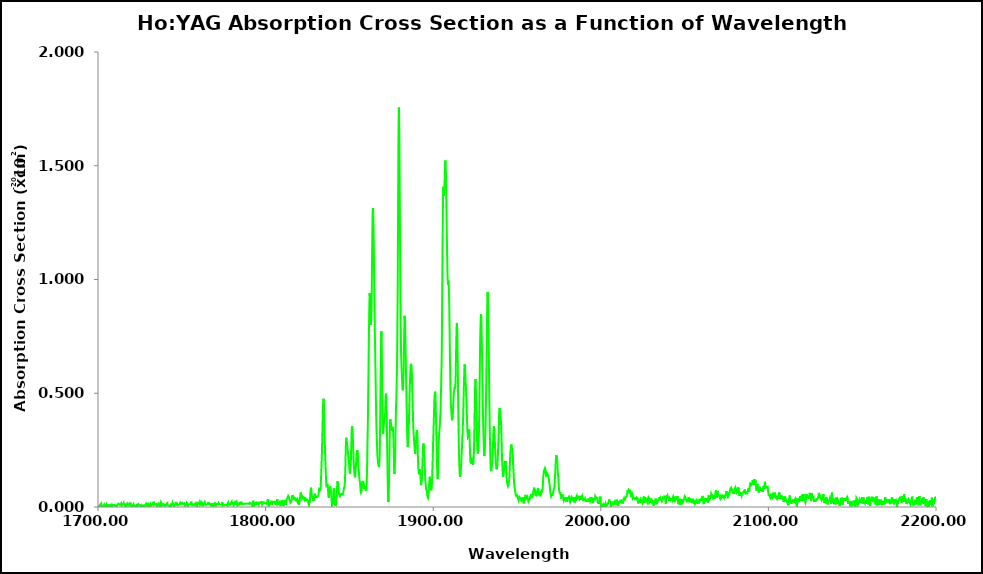
| Category | Series 0 |
|---|---|
| 1700.0 | 0.007 |
| 1700.1 | 0.005 |
| 1700.2 | 0.004 |
| 1700.3 | 0.005 |
| 1700.4 | 0.001 |
| 1700.5 | 0.006 |
| 1700.6 | 0.007 |
| 1700.7 | 0.004 |
| 1700.8 | 0.001 |
| 1700.9 | 0.002 |
| 1701.0 | 0.005 |
| 1701.1 | 0.004 |
| 1701.2 | 0.005 |
| 1701.3 | 0.01 |
| 1701.4 | 0.012 |
| 1701.5 | 0.01 |
| 1701.6 | 0.008 |
| 1701.7 | 0.011 |
| 1701.8 | 0.014 |
| 1701.9 | 0.015 |
| 1702.0 | 0.01 |
| 1702.1 | 0.012 |
| 1702.2 | 0.007 |
| 1702.3 | 0.004 |
| 1702.4 | 0.003 |
| 1702.5 | 0.005 |
| 1702.6 | 0.005 |
| 1702.7 | 0.006 |
| 1702.8 | 0.004 |
| 1702.9 | 0.002 |
| 1703.0 | 0.003 |
| 1703.1 | 0.004 |
| 1703.2 | 0.006 |
| 1703.3 | 0.007 |
| 1703.4 | 0.003 |
| 1703.5 | 0.001 |
| 1703.6 | 0.003 |
| 1703.7 | 0 |
| 1703.8 | 0.003 |
| 1703.9 | 0.01 |
| 1704.0 | 0.008 |
| 1704.1 | 0.008 |
| 1704.2 | 0.006 |
| 1704.3 | 0.008 |
| 1704.4 | 0.002 |
| 1704.5 | 0.003 |
| 1704.6 | 0.01 |
| 1704.7 | 0.008 |
| 1704.8 | 0.008 |
| 1704.9 | 0.006 |
| 1705.0 | 0.002 |
| 1705.1 | 0.003 |
| 1705.2 | 0.01 |
| 1705.3 | 0.008 |
| 1705.4 | 0.008 |
| 1705.5 | 0.006 |
| 1705.6 | 0.004 |
| 1705.7 | 0.006 |
| 1705.8 | 0.009 |
| 1705.9 | 0.009 |
| 1706.0 | 0.01 |
| 1706.1 | 0.009 |
| 1706.2 | 0.01 |
| 1706.3 | 0.009 |
| 1706.4 | 0.008 |
| 1706.5 | 0.01 |
| 1706.6 | 0.007 |
| 1706.7 | 0.004 |
| 1706.8 | 0.003 |
| 1706.9 | 0.008 |
| 1707.0 | 0.003 |
| 1707.1 | 0.007 |
| 1707.2 | 0.008 |
| 1707.3 | 0.008 |
| 1707.4 | 0.009 |
| 1707.5 | 0.01 |
| 1707.6 | 0.006 |
| 1707.7 | 0.005 |
| 1707.8 | 0.001 |
| 1707.9 | 0.001 |
| 1708.0 | 0.001 |
| 1708.1 | 0.001 |
| 1708.2 | 0.008 |
| 1708.3 | 0.006 |
| 1708.4 | 0.001 |
| 1708.5 | 0.008 |
| 1708.6 | 0.006 |
| 1708.7 | 0.004 |
| 1708.8 | 0.006 |
| 1708.9 | 0.007 |
| 1709.0 | 0.005 |
| 1709.1 | 0.007 |
| 1709.2 | 0.013 |
| 1709.3 | 0.008 |
| 1709.4 | 0.01 |
| 1709.5 | 0.008 |
| 1709.6 | 0.006 |
| 1709.7 | 0.006 |
| 1709.8 | 0.01 |
| 1709.9 | 0.008 |
| 1710.0 | 0.006 |
| 1710.1 | 0.008 |
| 1710.2 | 0.008 |
| 1710.3 | 0.005 |
| 1710.4 | 0.006 |
| 1710.5 | 0.007 |
| 1710.6 | 0.007 |
| 1710.7 | 0.007 |
| 1710.8 | 0.005 |
| 1710.9 | 0.005 |
| 1711.0 | 0.006 |
| 1711.1 | 0.002 |
| 1711.2 | 0.006 |
| 1711.3 | 0.001 |
| 1711.4 | 0.006 |
| 1711.5 | 0.008 |
| 1711.6 | 0.01 |
| 1711.7 | 0.011 |
| 1711.8 | 0.014 |
| 1711.9 | 0.012 |
| 1712.0 | 0.013 |
| 1712.1 | 0.013 |
| 1712.2 | 0.013 |
| 1712.3 | 0.015 |
| 1712.4 | 0.014 |
| 1712.5 | 0.011 |
| 1712.6 | 0.013 |
| 1712.7 | 0.011 |
| 1712.8 | 0.009 |
| 1712.9 | 0.009 |
| 1713.0 | 0.01 |
| 1713.1 | 0.01 |
| 1713.2 | 0.012 |
| 1713.3 | 0.008 |
| 1713.4 | 0.011 |
| 1713.5 | 0.01 |
| 1713.6 | 0.013 |
| 1713.7 | 0.013 |
| 1713.8 | 0.016 |
| 1713.9 | 0.011 |
| 1714.0 | 0.009 |
| 1714.1 | 0.005 |
| 1714.2 | 0.006 |
| 1714.3 | 0.007 |
| 1714.4 | 0.012 |
| 1714.5 | 0.012 |
| 1714.6 | 0.011 |
| 1714.7 | 0.012 |
| 1714.8 | 0.007 |
| 1714.9 | 0.008 |
| 1715.0 | 0.013 |
| 1715.1 | 0.017 |
| 1715.2 | 0.015 |
| 1715.3 | 0.018 |
| 1715.4 | 0.015 |
| 1715.5 | 0.013 |
| 1715.6 | 0.009 |
| 1715.7 | 0.008 |
| 1715.8 | 0.008 |
| 1715.9 | 0.008 |
| 1716.0 | 0.007 |
| 1716.1 | 0.003 |
| 1716.2 | 0.005 |
| 1716.3 | 0.004 |
| 1716.4 | 0.005 |
| 1716.5 | 0.007 |
| 1716.6 | 0.01 |
| 1716.7 | 0.006 |
| 1716.8 | 0.003 |
| 1716.9 | 0.001 |
| 1717.0 | 0.001 |
| 1717.1 | 0.002 |
| 1717.2 | 0.004 |
| 1717.3 | 0.008 |
| 1717.4 | 0.009 |
| 1717.5 | 0.007 |
| 1717.6 | 0.011 |
| 1717.7 | 0.015 |
| 1717.8 | 0.014 |
| 1717.9 | 0.014 |
| 1718.0 | 0.013 |
| 1718.1 | 0.013 |
| 1718.2 | 0.009 |
| 1718.3 | 0.009 |
| 1718.4 | 0.01 |
| 1718.5 | 0.01 |
| 1718.6 | 0.006 |
| 1718.7 | 0.014 |
| 1718.8 | 0.009 |
| 1718.9 | 0.011 |
| 1719.0 | 0.012 |
| 1719.1 | 0.011 |
| 1719.2 | 0.008 |
| 1719.3 | 0.013 |
| 1719.4 | 0.009 |
| 1719.5 | 0.009 |
| 1719.6 | 0.009 |
| 1719.7 | 0.006 |
| 1719.8 | 0.004 |
| 1719.9 | 0.001 |
| 1720.0 | 0.009 |
| 1720.1 | 0.009 |
| 1720.2 | 0.006 |
| 1720.3 | 0.004 |
| 1720.4 | 0.005 |
| 1720.5 | 0.009 |
| 1720.6 | 0.012 |
| 1720.7 | 0.009 |
| 1720.8 | 0 |
| 1720.9 | 0.006 |
| 1721.0 | 0.005 |
| 1721.1 | 0.009 |
| 1721.2 | 0.012 |
| 1721.3 | 0.009 |
| 1721.4 | 0.007 |
| 1721.5 | 0.01 |
| 1721.6 | 0.01 |
| 1721.7 | 0.004 |
| 1721.8 | 0.006 |
| 1721.9 | 0.008 |
| 1722.0 | 0.007 |
| 1722.1 | 0.006 |
| 1722.2 | 0.007 |
| 1722.3 | 0.007 |
| 1722.4 | 0.006 |
| 1722.5 | 0.006 |
| 1722.6 | 0.002 |
| 1722.7 | 0.002 |
| 1722.8 | 0.001 |
| 1722.9 | 0.004 |
| 1723.0 | 0.001 |
| 1723.1 | 0.004 |
| 1723.2 | 0.007 |
| 1723.3 | 0.01 |
| 1723.4 | 0.014 |
| 1723.5 | 0.011 |
| 1723.6 | 0.007 |
| 1723.7 | 0.009 |
| 1723.8 | 0.005 |
| 1723.9 | 0.004 |
| 1724.0 | 0.008 |
| 1724.1 | 0.012 |
| 1724.2 | 0.009 |
| 1724.3 | 0.009 |
| 1724.4 | 0.007 |
| 1724.5 | 0.003 |
| 1724.6 | 0.004 |
| 1724.7 | 0.005 |
| 1724.8 | 0.008 |
| 1724.9 | 0.01 |
| 1725.0 | 0.008 |
| 1725.1 | 0.009 |
| 1725.2 | 0.007 |
| 1725.3 | 0.005 |
| 1725.4 | 0.002 |
| 1725.5 | 0.003 |
| 1725.6 | 0.005 |
| 1725.7 | 0.006 |
| 1725.8 | 0.004 |
| 1725.9 | 0.005 |
| 1726.0 | 0.008 |
| 1726.1 | 0.007 |
| 1726.2 | 0.007 |
| 1726.3 | 0.007 |
| 1726.4 | 0.007 |
| 1726.5 | 0.006 |
| 1726.6 | 0.002 |
| 1726.7 | 0 |
| 1726.8 | 0.005 |
| 1726.9 | 0.006 |
| 1727.0 | 0.002 |
| 1727.1 | 0.003 |
| 1727.2 | 0.006 |
| 1727.3 | 0.003 |
| 1727.4 | 0.002 |
| 1727.5 | 0.006 |
| 1727.6 | 0.007 |
| 1727.7 | 0.008 |
| 1727.8 | 0.008 |
| 1727.9 | 0.01 |
| 1728.0 | 0.005 |
| 1728.1 | 0.006 |
| 1728.2 | 0.008 |
| 1728.3 | 0.008 |
| 1728.4 | 0.01 |
| 1728.5 | 0.002 |
| 1728.6 | 0.005 |
| 1728.7 | 0.014 |
| 1728.8 | 0.019 |
| 1728.9 | 0.016 |
| 1729.0 | 0.015 |
| 1729.1 | 0.009 |
| 1729.2 | 0.006 |
| 1729.3 | 0.015 |
| 1729.4 | 0.002 |
| 1729.5 | 0.001 |
| 1729.6 | 0.003 |
| 1729.7 | 0.001 |
| 1729.8 | 0.005 |
| 1729.9 | 0.007 |
| 1730.0 | 0.008 |
| 1730.1 | 0.008 |
| 1730.2 | 0.011 |
| 1730.3 | 0.01 |
| 1730.4 | 0.011 |
| 1730.5 | 0.008 |
| 1730.6 | 0.007 |
| 1730.7 | 0.004 |
| 1730.8 | 0.012 |
| 1730.9 | 0.01 |
| 1731.0 | 0.012 |
| 1731.1 | 0.013 |
| 1731.2 | 0.014 |
| 1731.3 | 0.009 |
| 1731.4 | 0.008 |
| 1731.5 | 0.013 |
| 1731.6 | 0.011 |
| 1731.7 | 0.009 |
| 1731.8 | 0.009 |
| 1731.9 | 0.008 |
| 1732.0 | 0.006 |
| 1732.1 | 0.01 |
| 1732.2 | 0.011 |
| 1732.3 | 0.007 |
| 1732.4 | 0.008 |
| 1732.5 | 0.01 |
| 1732.6 | 0.009 |
| 1732.7 | 0.012 |
| 1732.8 | 0.016 |
| 1732.9 | 0.017 |
| 1733.0 | 0.012 |
| 1733.1 | 0.011 |
| 1733.2 | 0.01 |
| 1733.3 | 0.012 |
| 1733.4 | 0.015 |
| 1733.5 | 0.017 |
| 1733.6 | 0.016 |
| 1733.7 | 0.016 |
| 1733.8 | 0.011 |
| 1733.9 | 0.009 |
| 1734.0 | 0.009 |
| 1734.1 | 0.007 |
| 1734.2 | 0.007 |
| 1734.3 | 0.012 |
| 1734.4 | 0.013 |
| 1734.5 | 0.01 |
| 1734.6 | 0.012 |
| 1734.7 | 0.014 |
| 1734.8 | 0.011 |
| 1734.9 | 0.008 |
| 1735.0 | 0.008 |
| 1735.1 | 0.009 |
| 1735.2 | 0.004 |
| 1735.3 | 0.006 |
| 1735.4 | 0.008 |
| 1735.5 | 0.014 |
| 1735.6 | 0.014 |
| 1735.7 | 0.016 |
| 1735.8 | 0.014 |
| 1735.9 | 0.016 |
| 1736.0 | 0.017 |
| 1736.1 | 0.016 |
| 1736.2 | 0.018 |
| 1736.3 | 0.019 |
| 1736.4 | 0.014 |
| 1736.5 | 0.007 |
| 1736.6 | 0.005 |
| 1736.7 | 0.004 |
| 1736.8 | 0.004 |
| 1736.9 | 0.002 |
| 1737.0 | 0.004 |
| 1737.1 | 0.006 |
| 1737.2 | 0.008 |
| 1737.3 | 0.008 |
| 1737.4 | 0.014 |
| 1737.5 | 0.018 |
| 1737.6 | 0.021 |
| 1737.7 | 0.018 |
| 1737.8 | 0.017 |
| 1737.9 | 0.016 |
| 1738.0 | 0.012 |
| 1738.1 | 0.007 |
| 1738.2 | 0.007 |
| 1738.3 | 0.007 |
| 1738.4 | 0.006 |
| 1738.5 | 0.011 |
| 1738.6 | 0.012 |
| 1738.7 | 0.015 |
| 1738.8 | 0.014 |
| 1738.9 | 0.015 |
| 1739.0 | 0.015 |
| 1739.1 | 0.015 |
| 1739.2 | 0.013 |
| 1739.3 | 0.014 |
| 1739.4 | 0.017 |
| 1739.5 | 0.009 |
| 1739.6 | 0.007 |
| 1739.7 | 0.002 |
| 1739.8 | 0.005 |
| 1739.9 | 0.003 |
| 1740.0 | 0.008 |
| 1740.1 | 0.007 |
| 1740.2 | 0.007 |
| 1740.3 | 0.006 |
| 1740.4 | 0.006 |
| 1740.5 | 0.005 |
| 1740.6 | 0.008 |
| 1740.7 | 0.012 |
| 1740.8 | 0.014 |
| 1740.9 | 0.01 |
| 1741.0 | 0.012 |
| 1741.1 | 0.014 |
| 1741.2 | 0.016 |
| 1741.3 | 0.016 |
| 1741.4 | 0.018 |
| 1741.5 | 0.011 |
| 1741.6 | 0.01 |
| 1741.7 | 0.01 |
| 1741.8 | 0.006 |
| 1741.9 | 0.002 |
| 1742.0 | 0.005 |
| 1742.1 | 0.004 |
| 1742.2 | 0.002 |
| 1742.3 | 0.003 |
| 1742.4 | 0.006 |
| 1742.5 | 0.007 |
| 1742.6 | 0.009 |
| 1742.7 | 0.007 |
| 1742.8 | 0.003 |
| 1742.9 | 0.006 |
| 1743.0 | 0.002 |
| 1743.1 | 0.007 |
| 1743.2 | 0.009 |
| 1743.3 | 0.007 |
| 1743.4 | 0.004 |
| 1743.5 | 0.011 |
| 1743.6 | 0.006 |
| 1743.7 | 0.01 |
| 1743.8 | 0.016 |
| 1743.9 | 0.016 |
| 1744.0 | 0.008 |
| 1744.1 | 0.007 |
| 1744.2 | 0.009 |
| 1744.3 | 0.008 |
| 1744.4 | 0.013 |
| 1744.5 | 0.018 |
| 1744.6 | 0.018 |
| 1744.7 | 0.015 |
| 1744.8 | 0.018 |
| 1744.9 | 0.012 |
| 1745.0 | 0.012 |
| 1745.1 | 0.008 |
| 1745.2 | 0.006 |
| 1745.3 | 0.002 |
| 1745.4 | 0.004 |
| 1745.5 | 0.002 |
| 1745.6 | 0.003 |
| 1745.7 | 0.002 |
| 1745.8 | 0.007 |
| 1745.9 | 0.008 |
| 1746.0 | 0.008 |
| 1746.1 | 0.011 |
| 1746.2 | 0.016 |
| 1746.3 | 0.012 |
| 1746.4 | 0.014 |
| 1746.5 | 0.014 |
| 1746.6 | 0.014 |
| 1746.7 | 0.012 |
| 1746.8 | 0.011 |
| 1746.9 | 0.015 |
| 1747.0 | 0.013 |
| 1747.1 | 0.016 |
| 1747.2 | 0.019 |
| 1747.3 | 0.02 |
| 1747.4 | 0.017 |
| 1747.5 | 0.015 |
| 1747.6 | 0.015 |
| 1747.7 | 0.008 |
| 1747.8 | 0.007 |
| 1747.9 | 0.008 |
| 1748.0 | 0.005 |
| 1748.1 | 0.003 |
| 1748.2 | 0.008 |
| 1748.3 | 0.01 |
| 1748.4 | 0.008 |
| 1748.5 | 0.013 |
| 1748.6 | 0.013 |
| 1748.7 | 0.01 |
| 1748.8 | 0.012 |
| 1748.9 | 0.012 |
| 1749.0 | 0.014 |
| 1749.1 | 0.019 |
| 1749.2 | 0.023 |
| 1749.3 | 0.02 |
| 1749.4 | 0.02 |
| 1749.5 | 0.019 |
| 1749.6 | 0.016 |
| 1749.7 | 0.014 |
| 1749.8 | 0.011 |
| 1749.9 | 0.015 |
| 1750.0 | 0.015 |
| 1750.1 | 0.015 |
| 1750.2 | 0.015 |
| 1750.3 | 0.019 |
| 1750.4 | 0.016 |
| 1750.5 | 0.018 |
| 1750.6 | 0.02 |
| 1750.7 | 0.018 |
| 1750.8 | 0.015 |
| 1750.9 | 0.013 |
| 1751.0 | 0.01 |
| 1751.1 | 0.011 |
| 1751.2 | 0.013 |
| 1751.3 | 0.015 |
| 1751.4 | 0.017 |
| 1751.5 | 0.016 |
| 1751.6 | 0.014 |
| 1751.7 | 0.013 |
| 1751.8 | 0.01 |
| 1751.9 | 0.008 |
| 1752.0 | 0.006 |
| 1752.1 | 0.004 |
| 1752.2 | 0.002 |
| 1752.3 | 0.004 |
| 1752.4 | 0.004 |
| 1752.5 | 0.007 |
| 1752.6 | 0.009 |
| 1752.7 | 0.011 |
| 1752.8 | 0.01 |
| 1752.9 | 0.014 |
| 1753.0 | 0.018 |
| 1753.1 | 0.018 |
| 1753.2 | 0.019 |
| 1753.3 | 0.02 |
| 1753.4 | 0.02 |
| 1753.5 | 0.012 |
| 1753.6 | 0.01 |
| 1753.7 | 0.005 |
| 1753.8 | 0.006 |
| 1753.9 | 0.005 |
| 1754.0 | 0.009 |
| 1754.1 | 0.007 |
| 1754.2 | 0.011 |
| 1754.3 | 0.008 |
| 1754.4 | 0.008 |
| 1754.5 | 0.008 |
| 1754.6 | 0.011 |
| 1754.7 | 0.012 |
| 1754.8 | 0.012 |
| 1754.9 | 0.013 |
| 1755.0 | 0.009 |
| 1755.1 | 0.009 |
| 1755.2 | 0.01 |
| 1755.3 | 0.01 |
| 1755.4 | 0.01 |
| 1755.5 | 0.016 |
| 1755.6 | 0.023 |
| 1755.7 | 0.02 |
| 1755.8 | 0.017 |
| 1755.9 | 0.015 |
| 1756.0 | 0.015 |
| 1756.1 | 0.007 |
| 1756.2 | 0.01 |
| 1756.3 | 0.015 |
| 1756.4 | 0.012 |
| 1756.5 | 0.012 |
| 1756.6 | 0.008 |
| 1756.7 | 0.004 |
| 1756.8 | 0.005 |
| 1756.9 | 0.008 |
| 1757.0 | 0.009 |
| 1757.1 | 0.007 |
| 1757.2 | 0.008 |
| 1757.3 | 0.009 |
| 1757.4 | 0.008 |
| 1757.5 | 0.005 |
| 1757.6 | 0.01 |
| 1757.7 | 0.013 |
| 1757.8 | 0.013 |
| 1757.9 | 0.015 |
| 1758.0 | 0.014 |
| 1758.1 | 0.016 |
| 1758.2 | 0.015 |
| 1758.3 | 0.018 |
| 1758.4 | 0.017 |
| 1758.5 | 0.018 |
| 1758.6 | 0.013 |
| 1758.7 | 0.007 |
| 1758.8 | 0.002 |
| 1758.9 | 0.007 |
| 1759.0 | 0.002 |
| 1759.1 | 0.008 |
| 1759.2 | 0.012 |
| 1759.3 | 0.017 |
| 1759.4 | 0.023 |
| 1759.5 | 0.021 |
| 1759.6 | 0.017 |
| 1759.7 | 0.019 |
| 1759.8 | 0.016 |
| 1759.9 | 0.015 |
| 1760.0 | 0.017 |
| 1760.1 | 0.021 |
| 1760.2 | 0.019 |
| 1760.3 | 0.015 |
| 1760.4 | 0.013 |
| 1760.5 | 0.013 |
| 1760.6 | 0.011 |
| 1760.7 | 0.014 |
| 1760.8 | 0.023 |
| 1760.9 | 0.02 |
| 1761.0 | 0.019 |
| 1761.1 | 0.018 |
| 1761.2 | 0.015 |
| 1761.3 | 0.009 |
| 1761.4 | 0.013 |
| 1761.5 | 0.009 |
| 1761.6 | 0.007 |
| 1761.7 | 0.008 |
| 1761.8 | 0.007 |
| 1761.9 | 0.01 |
| 1762.0 | 0.016 |
| 1762.1 | 0.019 |
| 1762.2 | 0.016 |
| 1762.3 | 0.018 |
| 1762.4 | 0.016 |
| 1762.5 | 0.009 |
| 1762.6 | 0.008 |
| 1762.7 | 0.015 |
| 1762.8 | 0.015 |
| 1762.9 | 0.016 |
| 1763.0 | 0.01 |
| 1763.1 | 0.009 |
| 1763.2 | 0.008 |
| 1763.3 | 0.009 |
| 1763.4 | 0.008 |
| 1763.5 | 0.012 |
| 1763.6 | 0.017 |
| 1763.7 | 0.012 |
| 1763.8 | 0.018 |
| 1763.9 | 0.019 |
| 1764.0 | 0.022 |
| 1764.1 | 0.014 |
| 1764.2 | 0.017 |
| 1764.3 | 0.01 |
| 1764.4 | 0.007 |
| 1764.5 | 0.008 |
| 1764.6 | 0.011 |
| 1764.7 | 0.012 |
| 1764.8 | 0.012 |
| 1764.9 | 0.012 |
| 1765.0 | 0.012 |
| 1765.1 | 0.012 |
| 1765.2 | 0.011 |
| 1765.3 | 0.011 |
| 1765.4 | 0.012 |
| 1765.5 | 0.012 |
| 1765.6 | 0.018 |
| 1765.7 | 0.018 |
| 1765.8 | 0.019 |
| 1765.9 | 0.022 |
| 1766.0 | 0.022 |
| 1766.1 | 0.022 |
| 1766.2 | 0.018 |
| 1766.3 | 0.019 |
| 1766.4 | 0.02 |
| 1766.5 | 0.019 |
| 1766.6 | 0.013 |
| 1766.7 | 0.013 |
| 1766.8 | 0.018 |
| 1766.9 | 0.016 |
| 1767.0 | 0.012 |
| 1767.1 | 0.009 |
| 1767.2 | 0.014 |
| 1767.3 | 0.011 |
| 1767.4 | 0.008 |
| 1767.5 | 0.014 |
| 1767.6 | 0.012 |
| 1767.7 | 0.01 |
| 1767.8 | 0.008 |
| 1767.9 | 0.008 |
| 1768.0 | 0.004 |
| 1768.1 | 0.017 |
| 1768.2 | 0.014 |
| 1768.3 | 0.012 |
| 1768.4 | 0.014 |
| 1768.5 | 0.013 |
| 1768.6 | 0.003 |
| 1768.7 | 0.007 |
| 1768.8 | 0.006 |
| 1768.9 | 0.005 |
| 1769.0 | 0.007 |
| 1769.1 | 0.009 |
| 1769.2 | 0.008 |
| 1769.3 | 0.012 |
| 1769.4 | 0.015 |
| 1769.5 | 0.017 |
| 1769.6 | 0.02 |
| 1769.7 | 0.016 |
| 1769.8 | 0.013 |
| 1769.9 | 0.012 |
| 1770.0 | 0.008 |
| 1770.1 | 0.011 |
| 1770.2 | 0.013 |
| 1770.3 | 0.013 |
| 1770.4 | 0.01 |
| 1770.5 | 0.015 |
| 1770.6 | 0.008 |
| 1770.7 | 0.01 |
| 1770.8 | 0.008 |
| 1770.9 | 0.011 |
| 1771.0 | 0.01 |
| 1771.1 | 0.011 |
| 1771.2 | 0.013 |
| 1771.3 | 0.015 |
| 1771.4 | 0.017 |
| 1771.5 | 0.011 |
| 1771.6 | 0.01 |
| 1771.7 | 0.01 |
| 1771.8 | 0.011 |
| 1771.9 | 0.008 |
| 1772.0 | 0.017 |
| 1772.1 | 0.021 |
| 1772.2 | 0.019 |
| 1772.3 | 0.014 |
| 1772.4 | 0.018 |
| 1772.5 | 0.011 |
| 1772.6 | 0.011 |
| 1772.7 | 0.015 |
| 1772.8 | 0.014 |
| 1772.9 | 0.01 |
| 1773.0 | 0.012 |
| 1773.1 | 0.01 |
| 1773.2 | 0.008 |
| 1773.3 | 0.01 |
| 1773.4 | 0.011 |
| 1773.5 | 0.007 |
| 1773.6 | 0.009 |
| 1773.7 | 0.012 |
| 1773.8 | 0.011 |
| 1773.9 | 0.013 |
| 1774.0 | 0.02 |
| 1774.1 | 0.013 |
| 1774.2 | 0.01 |
| 1774.3 | 0.008 |
| 1774.4 | 0.01 |
| 1774.5 | 0.008 |
| 1774.6 | 0.013 |
| 1774.7 | 0.016 |
| 1774.8 | 0.013 |
| 1774.9 | 0.008 |
| 1775.0 | 0.007 |
| 1775.1 | 0.007 |
| 1775.2 | 0.006 |
| 1775.3 | 0.009 |
| 1775.4 | 0.009 |
| 1775.5 | 0.008 |
| 1775.6 | 0.011 |
| 1775.7 | 0.008 |
| 1775.8 | 0.008 |
| 1775.9 | 0.01 |
| 1776.0 | 0.012 |
| 1776.1 | 0.01 |
| 1776.2 | 0.011 |
| 1776.3 | 0.011 |
| 1776.4 | 0.01 |
| 1776.5 | 0.009 |
| 1776.6 | 0.008 |
| 1776.7 | 0.01 |
| 1776.8 | 0.015 |
| 1776.9 | 0.008 |
| 1777.0 | 0.008 |
| 1777.1 | 0.009 |
| 1777.2 | 0.007 |
| 1777.3 | 0.006 |
| 1777.4 | 0.015 |
| 1777.5 | 0.018 |
| 1777.6 | 0.019 |
| 1777.7 | 0.02 |
| 1777.8 | 0.018 |
| 1777.9 | 0.014 |
| 1778.0 | 0.01 |
| 1778.1 | 0.014 |
| 1778.2 | 0.011 |
| 1778.3 | 0.013 |
| 1778.4 | 0.016 |
| 1778.5 | 0.012 |
| 1778.6 | 0.006 |
| 1778.7 | 0.005 |
| 1778.8 | 0.008 |
| 1778.9 | 0.012 |
| 1779.0 | 0.012 |
| 1779.1 | 0.012 |
| 1779.2 | 0.016 |
| 1779.3 | 0.018 |
| 1779.4 | 0.014 |
| 1779.5 | 0.017 |
| 1779.6 | 0.02 |
| 1779.7 | 0.023 |
| 1779.8 | 0.015 |
| 1779.9 | 0.014 |
| 1780.0 | 0.016 |
| 1780.1 | 0.017 |
| 1780.2 | 0.014 |
| 1780.3 | 0.018 |
| 1780.4 | 0.017 |
| 1780.5 | 0.017 |
| 1780.6 | 0.011 |
| 1780.7 | 0.011 |
| 1780.8 | 0.009 |
| 1780.9 | 0.007 |
| 1781.0 | 0.006 |
| 1781.1 | 0.012 |
| 1781.2 | 0.015 |
| 1781.3 | 0.012 |
| 1781.4 | 0.015 |
| 1781.5 | 0.017 |
| 1781.6 | 0.015 |
| 1781.7 | 0.01 |
| 1781.8 | 0.016 |
| 1781.9 | 0.015 |
| 1782.0 | 0.014 |
| 1782.1 | 0.015 |
| 1782.2 | 0.021 |
| 1782.3 | 0.021 |
| 1782.4 | 0.021 |
| 1782.5 | 0.019 |
| 1782.6 | 0.018 |
| 1782.7 | 0.014 |
| 1782.8 | 0.017 |
| 1782.9 | 0.02 |
| 1783.0 | 0.022 |
| 1783.1 | 0.018 |
| 1783.2 | 0.014 |
| 1783.3 | 0.01 |
| 1783.4 | 0.009 |
| 1783.5 | 0.01 |
| 1783.6 | 0.011 |
| 1783.7 | 0.013 |
| 1783.8 | 0.01 |
| 1783.9 | 0.01 |
| 1784.0 | 0.012 |
| 1784.1 | 0.012 |
| 1784.2 | 0.012 |
| 1784.3 | 0.017 |
| 1784.4 | 0.015 |
| 1784.5 | 0.011 |
| 1784.6 | 0.01 |
| 1784.7 | 0.011 |
| 1784.8 | 0.009 |
| 1784.9 | 0.009 |
| 1785.0 | 0.009 |
| 1785.1 | 0.014 |
| 1785.2 | 0.02 |
| 1785.3 | 0.022 |
| 1785.4 | 0.02 |
| 1785.5 | 0.023 |
| 1785.6 | 0.023 |
| 1785.7 | 0.018 |
| 1785.8 | 0.02 |
| 1785.9 | 0.023 |
| 1786.0 | 0.018 |
| 1786.1 | 0.015 |
| 1786.2 | 0.012 |
| 1786.3 | 0.009 |
| 1786.4 | 0.011 |
| 1786.5 | 0.011 |
| 1786.6 | 0.01 |
| 1786.7 | 0.01 |
| 1786.8 | 0.013 |
| 1786.9 | 0.013 |
| 1787.0 | 0.017 |
| 1787.1 | 0.016 |
| 1787.2 | 0.017 |
| 1787.3 | 0.015 |
| 1787.4 | 0.015 |
| 1787.5 | 0.012 |
| 1787.6 | 0.015 |
| 1787.7 | 0.016 |
| 1787.8 | 0.017 |
| 1787.9 | 0.016 |
| 1788.0 | 0.014 |
| 1788.1 | 0.013 |
| 1788.2 | 0.012 |
| 1788.3 | 0.013 |
| 1788.4 | 0.014 |
| 1788.5 | 0.012 |
| 1788.6 | 0.014 |
| 1788.7 | 0.013 |
| 1788.8 | 0.012 |
| 1788.9 | 0.013 |
| 1789.0 | 0.016 |
| 1789.1 | 0.016 |
| 1789.2 | 0.015 |
| 1789.3 | 0.015 |
| 1789.4 | 0.012 |
| 1789.5 | 0.012 |
| 1789.6 | 0.015 |
| 1789.7 | 0.016 |
| 1789.8 | 0.016 |
| 1789.9 | 0.017 |
| 1790.0 | 0.018 |
| 1790.1 | 0.015 |
| 1790.2 | 0.016 |
| 1790.3 | 0.012 |
| 1790.4 | 0.013 |
| 1790.5 | 0.016 |
| 1790.6 | 0.018 |
| 1790.7 | 0.02 |
| 1790.8 | 0.022 |
| 1790.9 | 0.02 |
| 1791.0 | 0.019 |
| 1791.1 | 0.019 |
| 1791.2 | 0.015 |
| 1791.3 | 0.014 |
| 1791.4 | 0.015 |
| 1791.5 | 0.014 |
| 1791.6 | 0.013 |
| 1791.7 | 0.014 |
| 1791.8 | 0.012 |
| 1791.9 | 0.013 |
| 1792.0 | 0.006 |
| 1792.1 | 0.004 |
| 1792.2 | 0.006 |
| 1792.3 | 0.013 |
| 1792.4 | 0.014 |
| 1792.5 | 0.028 |
| 1792.6 | 0.026 |
| 1792.7 | 0.027 |
| 1792.8 | 0.021 |
| 1792.9 | 0.015 |
| 1793.0 | 0.009 |
| 1793.1 | 0.01 |
| 1793.2 | 0.004 |
| 1793.3 | 0.005 |
| 1793.4 | 0.007 |
| 1793.5 | 0.01 |
| 1793.6 | 0.011 |
| 1793.7 | 0.015 |
| 1793.8 | 0.013 |
| 1793.9 | 0.019 |
| 1794.0 | 0.016 |
| 1794.1 | 0.016 |
| 1794.2 | 0.017 |
| 1794.3 | 0.019 |
| 1794.4 | 0.016 |
| 1794.5 | 0.012 |
| 1794.6 | 0.015 |
| 1794.7 | 0.015 |
| 1794.8 | 0.016 |
| 1794.9 | 0.011 |
| 1795.0 | 0.013 |
| 1795.1 | 0.013 |
| 1795.2 | 0.009 |
| 1795.3 | 0.01 |
| 1795.4 | 0.016 |
| 1795.5 | 0.018 |
| 1795.6 | 0.015 |
| 1795.7 | 0.019 |
| 1795.8 | 0.016 |
| 1795.9 | 0.011 |
| 1796.0 | 0.012 |
| 1796.1 | 0.019 |
| 1796.2 | 0.018 |
| 1796.3 | 0.019 |
| 1796.4 | 0.023 |
| 1796.5 | 0.021 |
| 1796.6 | 0.019 |
| 1796.7 | 0.02 |
| 1796.8 | 0.021 |
| 1796.9 | 0.018 |
| 1797.0 | 0.021 |
| 1797.1 | 0.02 |
| 1797.2 | 0.017 |
| 1797.3 | 0.018 |
| 1797.4 | 0.021 |
| 1797.5 | 0.025 |
| 1797.6 | 0.018 |
| 1797.7 | 0.018 |
| 1797.8 | 0.015 |
| 1797.9 | 0.011 |
| 1798.0 | 0.01 |
| 1798.1 | 0.014 |
| 1798.2 | 0.015 |
| 1798.3 | 0.019 |
| 1798.4 | 0.022 |
| 1798.5 | 0.019 |
| 1798.6 | 0.019 |
| 1798.7 | 0.019 |
| 1798.8 | 0.021 |
| 1798.9 | 0.021 |
| 1799.0 | 0.021 |
| 1799.1 | 0.019 |
| 1799.2 | 0.018 |
| 1799.3 | 0.016 |
| 1799.4 | 0.016 |
| 1799.5 | 0.016 |
| 1799.6 | 0.017 |
| 1799.7 | 0.018 |
| 1799.8 | 0.016 |
| 1799.9 | 0.016 |
| 1800.0 | 0.013 |
| 1800.1 | 0.016 |
| 1800.2 | 0.018 |
| 1800.3 | 0.019 |
| 1800.4 | 0.018 |
| 1800.5 | 0.018 |
| 1800.6 | 0.014 |
| 1800.7 | 0.016 |
| 1800.8 | 0.014 |
| 1800.9 | 0.016 |
| 1801.0 | 0.019 |
| 1801.1 | 0.027 |
| 1801.2 | 0.026 |
| 1801.3 | 0.031 |
| 1801.4 | 0.031 |
| 1801.5 | 0.035 |
| 1801.6 | 0.02 |
| 1801.7 | 0.018 |
| 1801.8 | 0.017 |
| 1801.9 | 0.015 |
| 1802.0 | 0.005 |
| 1802.1 | 0.012 |
| 1802.2 | 0.007 |
| 1802.3 | 0.006 |
| 1802.4 | 0.008 |
| 1802.5 | 0.01 |
| 1802.6 | 0.012 |
| 1802.7 | 0.017 |
| 1802.8 | 0.018 |
| 1802.9 | 0.017 |
| 1803.0 | 0.016 |
| 1803.1 | 0.015 |
| 1803.2 | 0.017 |
| 1803.3 | 0.016 |
| 1803.4 | 0.021 |
| 1803.5 | 0.023 |
| 1803.6 | 0.021 |
| 1803.7 | 0.02 |
| 1803.8 | 0.022 |
| 1803.9 | 0.016 |
| 1804.0 | 0.019 |
| 1804.1 | 0.023 |
| 1804.2 | 0.025 |
| 1804.3 | 0.025 |
| 1804.4 | 0.027 |
| 1804.5 | 0.021 |
| 1804.6 | 0.02 |
| 1804.7 | 0.022 |
| 1804.8 | 0.021 |
| 1804.9 | 0.021 |
| 1805.0 | 0.024 |
| 1805.1 | 0.024 |
| 1805.2 | 0.022 |
| 1805.3 | 0.021 |
| 1805.4 | 0.024 |
| 1805.5 | 0.027 |
| 1805.6 | 0.023 |
| 1805.7 | 0.019 |
| 1805.8 | 0.02 |
| 1805.9 | 0.013 |
| 1806.0 | 0.012 |
| 1806.1 | 0.009 |
| 1806.2 | 0.011 |
| 1806.3 | 0.01 |
| 1806.4 | 0.016 |
| 1806.5 | 0.011 |
| 1806.6 | 0.017 |
| 1806.7 | 0.024 |
| 1806.8 | 0.028 |
| 1806.9 | 0.028 |
| 1807.0 | 0.034 |
| 1807.1 | 0.03 |
| 1807.2 | 0.02 |
| 1807.3 | 0.016 |
| 1807.4 | 0.011 |
| 1807.5 | 0.009 |
| 1807.6 | 0.013 |
| 1807.7 | 0.02 |
| 1807.8 | 0.019 |
| 1807.9 | 0.023 |
| 1808.0 | 0.023 |
| 1808.1 | 0.023 |
| 1808.2 | 0.021 |
| 1808.3 | 0.024 |
| 1808.4 | 0.02 |
| 1808.5 | 0.018 |
| 1808.6 | 0.015 |
| 1808.7 | 0.016 |
| 1808.8 | 0.01 |
| 1808.9 | 0.011 |
| 1809.0 | 0.01 |
| 1809.1 | 0.01 |
| 1809.2 | 0.009 |
| 1809.3 | 0.015 |
| 1809.4 | 0.018 |
| 1809.5 | 0.024 |
| 1809.6 | 0.028 |
| 1809.7 | 0.033 |
| 1809.8 | 0.028 |
| 1809.9 | 0.019 |
| 1810.0 | 0.012 |
| 1810.1 | 0.005 |
| 1810.2 | 0.028 |
| 1810.3 | 0.005 |
| 1810.4 | 0.013 |
| 1810.5 | 0.024 |
| 1810.6 | 0.026 |
| 1810.7 | 0.024 |
| 1810.8 | 0.018 |
| 1810.9 | 0.012 |
| 1811.0 | 0.007 |
| 1811.1 | 0.009 |
| 1811.2 | 0.017 |
| 1811.3 | 0.024 |
| 1811.4 | 0.03 |
| 1811.5 | 0.033 |
| 1811.6 | 0.032 |
| 1811.7 | 0.027 |
| 1811.8 | 0.021 |
| 1811.9 | 0.021 |
| 1812.0 | 0.017 |
| 1812.1 | 0.009 |
| 1812.2 | 0.009 |
| 1812.3 | 0.021 |
| 1812.4 | 0.017 |
| 1812.5 | 0.022 |
| 1812.6 | 0.034 |
| 1812.7 | 0.037 |
| 1812.8 | 0.032 |
| 1812.9 | 0.037 |
| 1813.0 | 0.036 |
| 1813.1 | 0.041 |
| 1813.2 | 0.04 |
| 1813.3 | 0.044 |
| 1813.4 | 0.042 |
| 1813.5 | 0.049 |
| 1813.6 | 0.046 |
| 1813.7 | 0.05 |
| 1813.8 | 0.048 |
| 1813.9 | 0.044 |
| 1814.0 | 0.038 |
| 1814.1 | 0.034 |
| 1814.2 | 0.032 |
| 1814.3 | 0.031 |
| 1814.4 | 0.029 |
| 1814.5 | 0.03 |
| 1814.6 | 0.027 |
| 1814.7 | 0.027 |
| 1814.8 | 0.019 |
| 1814.9 | 0.021 |
| 1815.0 | 0.021 |
| 1815.1 | 0.018 |
| 1815.2 | 0.016 |
| 1815.3 | 0.024 |
| 1815.4 | 0.025 |
| 1815.5 | 0.025 |
| 1815.6 | 0.035 |
| 1815.7 | 0.041 |
| 1815.8 | 0.044 |
| 1815.9 | 0.046 |
| 1816.0 | 0.052 |
| 1816.1 | 0.05 |
| 1816.2 | 0.056 |
| 1816.3 | 0.052 |
| 1816.4 | 0.05 |
| 1816.5 | 0.042 |
| 1816.6 | 0.04 |
| 1816.7 | 0.032 |
| 1816.8 | 0.031 |
| 1816.9 | 0.031 |
| 1817.0 | 0.035 |
| 1817.1 | 0.041 |
| 1817.2 | 0.04 |
| 1817.3 | 0.042 |
| 1817.4 | 0.044 |
| 1817.5 | 0.046 |
| 1817.6 | 0.04 |
| 1817.7 | 0.038 |
| 1817.8 | 0.037 |
| 1817.9 | 0.033 |
| 1818.0 | 0.031 |
| 1818.1 | 0.025 |
| 1818.2 | 0.026 |
| 1818.3 | 0.03 |
| 1818.4 | 0.037 |
| 1818.5 | 0.036 |
| 1818.6 | 0.036 |
| 1818.7 | 0.037 |
| 1818.8 | 0.034 |
| 1818.9 | 0.026 |
| 1819.0 | 0.025 |
| 1819.1 | 0.033 |
| 1819.2 | 0.034 |
| 1819.3 | 0.029 |
| 1819.4 | 0.037 |
| 1819.5 | 0.036 |
| 1819.6 | 0.029 |
| 1819.7 | 0.022 |
| 1819.8 | 0.019 |
| 1819.9 | 0.01 |
| 1820.0 | 0.01 |
| 1820.1 | 0.017 |
| 1820.2 | 0.02 |
| 1820.3 | 0.024 |
| 1820.4 | 0.032 |
| 1820.5 | 0.04 |
| 1820.6 | 0.041 |
| 1820.7 | 0.045 |
| 1820.8 | 0.056 |
| 1820.9 | 0.063 |
| 1821.0 | 0.062 |
| 1821.1 | 0.058 |
| 1821.2 | 0.061 |
| 1821.3 | 0.059 |
| 1821.4 | 0.052 |
| 1821.5 | 0.049 |
| 1821.6 | 0.049 |
| 1821.7 | 0.044 |
| 1821.8 | 0.038 |
| 1821.9 | 0.037 |
| 1822.0 | 0.039 |
| 1822.1 | 0.038 |
| 1822.2 | 0.041 |
| 1822.3 | 0.045 |
| 1822.4 | 0.043 |
| 1822.5 | 0.041 |
| 1822.6 | 0.048 |
| 1822.7 | 0.047 |
| 1822.8 | 0.04 |
| 1822.9 | 0.039 |
| 1823.0 | 0.038 |
| 1823.1 | 0.034 |
| 1823.2 | 0.034 |
| 1823.3 | 0.04 |
| 1823.4 | 0.042 |
| 1823.5 | 0.044 |
| 1823.6 | 0.041 |
| 1823.7 | 0.044 |
| 1823.8 | 0.04 |
| 1823.9 | 0.038 |
| 1824.0 | 0.036 |
| 1824.1 | 0.036 |
| 1824.2 | 0.03 |
| 1824.3 | 0.027 |
| 1824.4 | 0.032 |
| 1824.5 | 0.031 |
| 1824.6 | 0.03 |
| 1824.7 | 0.032 |
| 1824.8 | 0.032 |
| 1824.9 | 0.033 |
| 1825.0 | 0.031 |
| 1825.1 | 0.031 |
| 1825.2 | 0.029 |
| 1825.3 | 0.027 |
| 1825.4 | 0.022 |
| 1825.5 | 0.019 |
| 1825.6 | 0.016 |
| 1825.7 | 0.012 |
| 1825.8 | 0.013 |
| 1825.9 | 0.009 |
| 1826.0 | 0.013 |
| 1826.1 | 0.012 |
| 1826.2 | 0.012 |
| 1826.3 | 0.018 |
| 1826.4 | 0.029 |
| 1826.5 | 0.036 |
| 1826.6 | 0.047 |
| 1826.7 | 0.06 |
| 1826.8 | 0.071 |
| 1826.9 | 0.076 |
| 1827.0 | 0.08 |
| 1827.1 | 0.085 |
| 1827.2 | 0.082 |
| 1827.3 | 0.075 |
| 1827.4 | 0.067 |
| 1827.5 | 0.06 |
| 1827.6 | 0.051 |
| 1827.7 | 0.048 |
| 1827.8 | 0.044 |
| 1827.9 | 0.042 |
| 1828.0 | 0.036 |
| 1828.1 | 0.032 |
| 1828.2 | 0.03 |
| 1828.3 | 0.029 |
| 1828.4 | 0.027 |
| 1828.5 | 0.026 |
| 1828.6 | 0.028 |
| 1828.7 | 0.03 |
| 1828.8 | 0.03 |
| 1828.9 | 0.035 |
| 1829.0 | 0.041 |
| 1829.1 | 0.049 |
| 1829.2 | 0.049 |
| 1829.3 | 0.058 |
| 1829.4 | 0.055 |
| 1829.5 | 0.056 |
| 1829.6 | 0.05 |
| 1829.7 | 0.051 |
| 1829.8 | 0.043 |
| 1829.9 | 0.049 |
| 1830.0 | 0.047 |
| 1830.1 | 0.046 |
| 1830.2 | 0.044 |
| 1830.3 | 0.045 |
| 1830.4 | 0.041 |
| 1830.5 | 0.04 |
| 1830.6 | 0.043 |
| 1830.7 | 0.045 |
| 1830.8 | 0.043 |
| 1830.9 | 0.041 |
| 1831.0 | 0.044 |
| 1831.1 | 0.043 |
| 1831.2 | 0.04 |
| 1831.3 | 0.042 |
| 1831.4 | 0.049 |
| 1831.5 | 0.052 |
| 1831.6 | 0.055 |
| 1831.7 | 0.066 |
| 1831.8 | 0.074 |
| 1831.9 | 0.078 |
| 1832.0 | 0.079 |
| 1832.1 | 0.083 |
| 1832.2 | 0.081 |
| 1832.3 | 0.078 |
| 1832.4 | 0.074 |
| 1832.5 | 0.076 |
| 1832.6 | 0.074 |
| 1832.7 | 0.078 |
| 1832.8 | 0.08 |
| 1832.9 | 0.093 |
| 1833.0 | 0.108 |
| 1833.1 | 0.13 |
| 1833.2 | 0.147 |
| 1833.3 | 0.175 |
| 1833.4 | 0.195 |
| 1833.5 | 0.218 |
| 1833.6 | 0.237 |
| 1833.7 | 0.27 |
| 1833.8 | 0.3 |
| 1833.9 | 0.335 |
| 1834.0 | 0.365 |
| 1834.1 | 0.403 |
| 1834.2 | 0.431 |
| 1834.3 | 0.446 |
| 1834.4 | 0.465 |
| 1834.5 | 0.476 |
| 1834.6 | 0.479 |
| 1834.7 | 0.467 |
| 1834.8 | 0.451 |
| 1834.9 | 0.419 |
| 1835.0 | 0.392 |
| 1835.1 | 0.354 |
| 1835.2 | 0.316 |
| 1835.3 | 0.291 |
| 1835.4 | 0.264 |
| 1835.5 | 0.237 |
| 1835.6 | 0.212 |
| 1835.7 | 0.194 |
| 1835.8 | 0.171 |
| 1835.9 | 0.153 |
| 1836.0 | 0.131 |
| 1836.1 | 0.119 |
| 1836.2 | 0.104 |
| 1836.3 | 0.093 |
| 1836.4 | 0.087 |
| 1836.5 | 0.093 |
| 1836.6 | 0.092 |
| 1836.7 | 0.102 |
| 1836.8 | 0.104 |
| 1836.9 | 0.105 |
| 1837.0 | 0.1 |
| 1837.1 | 0.094 |
| 1837.2 | 0.082 |
| 1837.3 | 0.069 |
| 1837.4 | 0.057 |
| 1837.5 | 0.048 |
| 1837.6 | 0.048 |
| 1837.7 | 0.041 |
| 1837.8 | 0.044 |
| 1837.9 | 0.053 |
| 1838.0 | 0.056 |
| 1838.1 | 0.06 |
| 1838.2 | 0.07 |
| 1838.3 | 0.083 |
| 1838.4 | 0.086 |
| 1838.5 | 0.091 |
| 1838.6 | 0.09 |
| 1838.7 | 0.089 |
| 1838.8 | 0.08 |
| 1838.9 | 0.077 |
| 1839.0 | 0.07 |
| 1839.1 | 0.061 |
| 1839.2 | 0.05 |
| 1839.3 | 0.041 |
| 1839.4 | 0.025 |
| 1839.5 | 0.012 |
| 1839.6 | 0 |
| 1839.7 | 0.041 |
| 1839.8 | 0.025 |
| 1839.9 | 0.012 |
| 1840.0 | 0.009 |
| 1840.1 | 0.016 |
| 1840.2 | 0.026 |
| 1840.3 | 0.039 |
| 1840.4 | 0.053 |
| 1840.5 | 0.068 |
| 1840.6 | 0.081 |
| 1840.7 | 0.08 |
| 1840.8 | 0.079 |
| 1840.9 | 0.074 |
| 1841.0 | 0.061 |
| 1841.1 | 0.052 |
| 1841.2 | 0.046 |
| 1841.3 | 0.036 |
| 1841.4 | 0.025 |
| 1841.5 | 0.017 |
| 1841.6 | 0.008 |
| 1841.7 | 0.022 |
| 1841.8 | 0.004 |
| 1841.9 | 0.009 |
| 1842.0 | 0.014 |
| 1842.1 | 0.022 |
| 1842.2 | 0.032 |
| 1842.3 | 0.035 |
| 1842.4 | 0.045 |
| 1842.5 | 0.062 |
| 1842.6 | 0.078 |
| 1842.7 | 0.095 |
| 1842.8 | 0.109 |
| 1842.9 | 0.113 |
| 1843.0 | 0.111 |
| 1843.1 | 0.116 |
| 1843.2 | 0.111 |
| 1843.3 | 0.104 |
| 1843.4 | 0.098 |
| 1843.5 | 0.09 |
| 1843.6 | 0.072 |
| 1843.7 | 0.064 |
| 1843.8 | 0.057 |
| 1843.9 | 0.057 |
| 1844.0 | 0.056 |
| 1844.1 | 0.056 |
| 1844.2 | 0.053 |
| 1844.3 | 0.053 |
| 1844.4 | 0.047 |
| 1844.5 | 0.048 |
| 1844.6 | 0.05 |
| 1844.7 | 0.052 |
| 1844.8 | 0.053 |
| 1844.9 | 0.057 |
| 1845.0 | 0.057 |
| 1845.1 | 0.055 |
| 1845.2 | 0.055 |
| 1845.3 | 0.058 |
| 1845.4 | 0.059 |
| 1845.5 | 0.057 |
| 1845.6 | 0.057 |
| 1845.7 | 0.056 |
| 1845.8 | 0.057 |
| 1845.9 | 0.058 |
| 1846.0 | 0.053 |
| 1846.1 | 0.055 |
| 1846.2 | 0.059 |
| 1846.3 | 0.059 |
| 1846.4 | 0.059 |
| 1846.5 | 0.068 |
| 1846.6 | 0.077 |
| 1846.7 | 0.078 |
| 1846.8 | 0.083 |
| 1846.9 | 0.087 |
| 1847.0 | 0.087 |
| 1847.1 | 0.09 |
| 1847.2 | 0.1 |
| 1847.3 | 0.11 |
| 1847.4 | 0.127 |
| 1847.5 | 0.15 |
| 1847.6 | 0.177 |
| 1847.7 | 0.214 |
| 1847.8 | 0.245 |
| 1847.9 | 0.27 |
| 1848.0 | 0.296 |
| 1848.1 | 0.304 |
| 1848.2 | 0.301 |
| 1848.3 | 0.298 |
| 1848.4 | 0.293 |
| 1848.5 | 0.285 |
| 1848.6 | 0.276 |
| 1848.7 | 0.266 |
| 1848.8 | 0.261 |
| 1848.9 | 0.254 |
| 1849.0 | 0.248 |
| 1849.1 | 0.242 |
| 1849.2 | 0.235 |
| 1849.3 | 0.224 |
| 1849.4 | 0.218 |
| 1849.5 | 0.209 |
| 1849.6 | 0.199 |
| 1849.7 | 0.193 |
| 1849.8 | 0.186 |
| 1849.9 | 0.179 |
| 1850.0 | 0.167 |
| 1850.1 | 0.161 |
| 1850.2 | 0.152 |
| 1850.3 | 0.149 |
| 1850.4 | 0.147 |
| 1850.5 | 0.152 |
| 1850.6 | 0.158 |
| 1850.7 | 0.176 |
| 1850.8 | 0.188 |
| 1850.9 | 0.21 |
| 1851.0 | 0.237 |
| 1851.1 | 0.27 |
| 1851.2 | 0.294 |
| 1851.3 | 0.322 |
| 1851.4 | 0.34 |
| 1851.5 | 0.347 |
| 1851.6 | 0.356 |
| 1851.7 | 0.355 |
| 1851.8 | 0.346 |
| 1851.9 | 0.329 |
| 1852.0 | 0.318 |
| 1852.1 | 0.292 |
| 1852.2 | 0.267 |
| 1852.3 | 0.247 |
| 1852.4 | 0.231 |
| 1852.5 | 0.21 |
| 1852.6 | 0.193 |
| 1852.7 | 0.183 |
| 1852.8 | 0.169 |
| 1852.9 | 0.158 |
| 1853.0 | 0.147 |
| 1853.1 | 0.14 |
| 1853.2 | 0.138 |
| 1853.3 | 0.136 |
| 1853.4 | 0.131 |
| 1853.5 | 0.139 |
| 1853.6 | 0.151 |
| 1853.7 | 0.153 |
| 1853.8 | 0.167 |
| 1853.9 | 0.183 |
| 1854.0 | 0.195 |
| 1854.1 | 0.21 |
| 1854.2 | 0.22 |
| 1854.3 | 0.226 |
| 1854.4 | 0.235 |
| 1854.5 | 0.236 |
| 1854.6 | 0.235 |
| 1854.7 | 0.25 |
| 1854.8 | 0.253 |
| 1854.9 | 0.244 |
| 1855.0 | 0.236 |
| 1855.1 | 0.219 |
| 1855.2 | 0.199 |
| 1855.3 | 0.187 |
| 1855.4 | 0.177 |
| 1855.5 | 0.167 |
| 1855.6 | 0.165 |
| 1855.7 | 0.152 |
| 1855.8 | 0.139 |
| 1855.9 | 0.13 |
| 1856.0 | 0.126 |
| 1856.1 | 0.116 |
| 1856.2 | 0.115 |
| 1856.3 | 0.111 |
| 1856.4 | 0.102 |
| 1856.5 | 0.089 |
| 1856.6 | 0.084 |
| 1856.7 | 0.07 |
| 1856.8 | 0.066 |
| 1856.9 | 0.064 |
| 1857.0 | 0.064 |
| 1857.1 | 0.063 |
| 1857.2 | 0.067 |
| 1857.3 | 0.073 |
| 1857.4 | 0.085 |
| 1857.5 | 0.094 |
| 1857.6 | 0.104 |
| 1857.7 | 0.11 |
| 1857.8 | 0.111 |
| 1857.9 | 0.108 |
| 1858.0 | 0.111 |
| 1858.1 | 0.109 |
| 1858.2 | 0.111 |
| 1858.3 | 0.111 |
| 1858.4 | 0.11 |
| 1858.5 | 0.102 |
| 1858.6 | 0.093 |
| 1858.7 | 0.085 |
| 1858.8 | 0.082 |
| 1858.9 | 0.079 |
| 1859.0 | 0.084 |
| 1859.1 | 0.09 |
| 1859.2 | 0.093 |
| 1859.3 | 0.094 |
| 1859.4 | 0.094 |
| 1859.5 | 0.089 |
| 1859.6 | 0.083 |
| 1859.7 | 0.078 |
| 1859.8 | 0.076 |
| 1859.9 | 0.07 |
| 1860.0 | 0.067 |
| 1860.1 | 0.072 |
| 1860.2 | 0.084 |
| 1860.3 | 0.093 |
| 1860.4 | 0.123 |
| 1860.5 | 0.159 |
| 1860.6 | 0.191 |
| 1860.7 | 0.233 |
| 1860.8 | 0.284 |
| 1860.9 | 0.325 |
| 1861.0 | 0.366 |
| 1861.1 | 0.425 |
| 1861.2 | 0.485 |
| 1861.3 | 0.54 |
| 1861.4 | 0.606 |
| 1861.5 | 0.683 |
| 1861.6 | 0.739 |
| 1861.7 | 0.786 |
| 1861.8 | 0.843 |
| 1861.9 | 0.89 |
| 1862.0 | 0.914 |
| 1862.1 | 0.94 |
| 1862.2 | 0.939 |
| 1862.3 | 0.922 |
| 1862.4 | 0.885 |
| 1862.5 | 0.864 |
| 1862.6 | 0.827 |
| 1862.7 | 0.813 |
| 1862.8 | 0.8 |
| 1862.9 | 0.808 |
| 1863.0 | 0.809 |
| 1863.1 | 0.844 |
| 1863.2 | 0.882 |
| 1863.3 | 0.943 |
| 1863.4 | 1.001 |
| 1863.5 | 1.082 |
| 1863.6 | 1.147 |
| 1863.7 | 1.208 |
| 1863.8 | 1.257 |
| 1863.9 | 1.305 |
| 1864.0 | 1.314 |
| 1864.1 | 1.316 |
| 1864.2 | 1.299 |
| 1864.3 | 1.262 |
| 1864.4 | 1.213 |
| 1864.5 | 1.176 |
| 1864.6 | 1.121 |
| 1864.7 | 1.066 |
| 1864.8 | 0.993 |
| 1864.9 | 0.935 |
| 1865.0 | 0.871 |
| 1865.1 | 0.814 |
| 1865.2 | 0.757 |
| 1865.3 | 0.723 |
| 1865.4 | 0.673 |
| 1865.5 | 0.626 |
| 1865.6 | 0.585 |
| 1865.7 | 0.537 |
| 1865.8 | 0.488 |
| 1865.9 | 0.442 |
| 1866.0 | 0.399 |
| 1866.1 | 0.365 |
| 1866.2 | 0.338 |
| 1866.3 | 0.312 |
| 1866.4 | 0.287 |
| 1866.5 | 0.268 |
| 1866.6 | 0.247 |
| 1866.7 | 0.23 |
| 1866.8 | 0.218 |
| 1866.9 | 0.212 |
| 1867.0 | 0.203 |
| 1867.1 | 0.193 |
| 1867.2 | 0.194 |
| 1867.3 | 0.185 |
| 1867.4 | 0.182 |
| 1867.5 | 0.182 |
| 1867.6 | 0.183 |
| 1867.7 | 0.176 |
| 1867.8 | 0.186 |
| 1867.9 | 0.199 |
| 1868.0 | 0.216 |
| 1868.1 | 0.239 |
| 1868.2 | 0.286 |
| 1868.3 | 0.335 |
| 1868.4 | 0.385 |
| 1868.5 | 0.463 |
| 1868.6 | 0.542 |
| 1868.7 | 0.616 |
| 1868.8 | 0.681 |
| 1868.9 | 0.736 |
| 1869.0 | 0.748 |
| 1869.1 | 0.773 |
| 1869.2 | 0.75 |
| 1869.3 | 0.707 |
| 1869.4 | 0.641 |
| 1869.5 | 0.593 |
| 1869.6 | 0.518 |
| 1869.7 | 0.448 |
| 1869.8 | 0.401 |
| 1869.9 | 0.373 |
| 1870.0 | 0.34 |
| 1870.1 | 0.322 |
| 1870.2 | 0.33 |
| 1870.3 | 0.339 |
| 1870.4 | 0.346 |
| 1870.5 | 0.355 |
| 1870.6 | 0.369 |
| 1870.7 | 0.378 |
| 1870.8 | 0.385 |
| 1870.9 | 0.392 |
| 1871.0 | 0.396 |
| 1871.1 | 0.401 |
| 1871.2 | 0.403 |
| 1871.3 | 0.41 |
| 1871.4 | 0.424 |
| 1871.5 | 0.447 |
| 1871.6 | 0.47 |
| 1871.7 | 0.492 |
| 1871.8 | 0.498 |
| 1871.9 | 0.499 |
| 1872.0 | 0.487 |
| 1872.1 | 0.459 |
| 1872.2 | 0.422 |
| 1872.3 | 0.389 |
| 1872.4 | 0.341 |
| 1872.5 | 0.288 |
| 1872.6 | 0.234 |
| 1872.7 | 0.192 |
| 1872.8 | 0.144 |
| 1872.9 | 0.101 |
| 1873.0 | 0.063 |
| 1873.1 | 0.042 |
| 1873.2 | 0.022 |
| 1873.3 | 0.02 |
| 1873.4 | 0.038 |
| 1873.5 | 0.06 |
| 1873.6 | 0.102 |
| 1873.7 | 0.151 |
| 1873.8 | 0.2 |
| 1873.9 | 0.241 |
| 1874.0 | 0.298 |
| 1874.1 | 0.328 |
| 1874.2 | 0.355 |
| 1874.3 | 0.373 |
| 1874.4 | 0.385 |
| 1874.5 | 0.385 |
| 1874.6 | 0.377 |
| 1874.7 | 0.377 |
| 1874.8 | 0.366 |
| 1874.9 | 0.367 |
| 1875.0 | 0.355 |
| 1875.1 | 0.352 |
| 1875.2 | 0.346 |
| 1875.3 | 0.345 |
| 1875.4 | 0.337 |
| 1875.5 | 0.343 |
| 1875.6 | 0.346 |
| 1875.7 | 0.346 |
| 1875.8 | 0.352 |
| 1875.9 | 0.352 |
| 1876.0 | 0.343 |
| 1876.1 | 0.33 |
| 1876.2 | 0.314 |
| 1876.3 | 0.284 |
| 1876.4 | 0.256 |
| 1876.5 | 0.226 |
| 1876.6 | 0.198 |
| 1876.7 | 0.166 |
| 1876.8 | 0.151 |
| 1876.9 | 0.145 |
| 1877.0 | 0.152 |
| 1877.1 | 0.176 |
| 1877.2 | 0.205 |
| 1877.3 | 0.238 |
| 1877.4 | 0.281 |
| 1877.5 | 0.325 |
| 1877.6 | 0.359 |
| 1877.7 | 0.395 |
| 1877.8 | 0.436 |
| 1877.9 | 0.454 |
| 1878.0 | 0.476 |
| 1878.1 | 0.501 |
| 1878.2 | 0.538 |
| 1878.3 | 0.572 |
| 1878.4 | 0.617 |
| 1878.5 | 0.681 |
| 1878.6 | 0.762 |
| 1878.7 | 0.85 |
| 1878.8 | 0.955 |
| 1878.9 | 1.106 |
| 1879.0 | 1.243 |
| 1879.1 | 1.377 |
| 1879.2 | 1.523 |
| 1879.3 | 1.64 |
| 1879.4 | 1.701 |
| 1879.5 | 1.756 |
| 1879.6 | 1.743 |
| 1879.7 | 1.679 |
| 1879.8 | 1.607 |
| 1879.9 | 1.522 |
| 1880.0 | 1.395 |
| 1880.1 | 1.294 |
| 1880.2 | 1.192 |
| 1880.3 | 1.085 |
| 1880.4 | 0.975 |
| 1880.5 | 0.887 |
| 1880.6 | 0.81 |
| 1880.7 | 0.746 |
| 1880.8 | 0.69 |
| 1880.9 | 0.661 |
| 1881.0 | 0.642 |
| 1881.1 | 0.619 |
| 1881.2 | 0.593 |
| 1881.3 | 0.585 |
| 1881.4 | 0.565 |
| 1881.5 | 0.543 |
| 1881.6 | 0.532 |
| 1881.7 | 0.522 |
| 1881.8 | 0.513 |
| 1881.9 | 0.516 |
| 1882.0 | 0.521 |
| 1882.1 | 0.538 |
| 1882.2 | 0.56 |
| 1882.3 | 0.589 |
| 1882.4 | 0.617 |
| 1882.5 | 0.666 |
| 1882.6 | 0.703 |
| 1882.7 | 0.759 |
| 1882.8 | 0.802 |
| 1882.9 | 0.84 |
| 1883.0 | 0.843 |
| 1883.1 | 0.839 |
| 1883.2 | 0.818 |
| 1883.3 | 0.785 |
| 1883.4 | 0.742 |
| 1883.5 | 0.708 |
| 1883.6 | 0.668 |
| 1883.7 | 0.617 |
| 1883.8 | 0.581 |
| 1883.9 | 0.542 |
| 1884.0 | 0.503 |
| 1884.1 | 0.459 |
| 1884.2 | 0.425 |
| 1884.3 | 0.387 |
| 1884.4 | 0.352 |
| 1884.5 | 0.312 |
| 1884.6 | 0.292 |
| 1884.7 | 0.278 |
| 1884.8 | 0.263 |
| 1884.9 | 0.263 |
| 1885.0 | 0.278 |
| 1885.1 | 0.291 |
| 1885.2 | 0.303 |
| 1885.3 | 0.324 |
| 1885.4 | 0.347 |
| 1885.5 | 0.369 |
| 1885.6 | 0.398 |
| 1885.7 | 0.426 |
| 1885.8 | 0.461 |
| 1885.9 | 0.492 |
| 1886.0 | 0.522 |
| 1886.1 | 0.543 |
| 1886.2 | 0.564 |
| 1886.3 | 0.585 |
| 1886.4 | 0.6 |
| 1886.5 | 0.613 |
| 1886.6 | 0.625 |
| 1886.7 | 0.629 |
| 1886.8 | 0.628 |
| 1886.9 | 0.63 |
| 1887.0 | 0.62 |
| 1887.1 | 0.612 |
| 1887.2 | 0.601 |
| 1887.3 | 0.584 |
| 1887.4 | 0.552 |
| 1887.5 | 0.532 |
| 1887.6 | 0.5 |
| 1887.7 | 0.473 |
| 1887.8 | 0.44 |
| 1887.9 | 0.41 |
| 1888.0 | 0.38 |
| 1888.1 | 0.36 |
| 1888.2 | 0.334 |
| 1888.3 | 0.325 |
| 1888.4 | 0.317 |
| 1888.5 | 0.302 |
| 1888.6 | 0.291 |
| 1888.7 | 0.289 |
| 1888.8 | 0.272 |
| 1888.9 | 0.262 |
| 1889.0 | 0.251 |
| 1889.1 | 0.242 |
| 1889.2 | 0.233 |
| 1889.3 | 0.236 |
| 1889.4 | 0.24 |
| 1889.5 | 0.253 |
| 1889.6 | 0.264 |
| 1889.7 | 0.279 |
| 1889.8 | 0.292 |
| 1889.9 | 0.308 |
| 1890.0 | 0.32 |
| 1890.1 | 0.33 |
| 1890.2 | 0.337 |
| 1890.3 | 0.341 |
| 1890.4 | 0.33 |
| 1890.5 | 0.318 |
| 1890.6 | 0.301 |
| 1890.7 | 0.276 |
| 1890.8 | 0.241 |
| 1890.9 | 0.215 |
| 1891.0 | 0.195 |
| 1891.1 | 0.176 |
| 1891.2 | 0.162 |
| 1891.3 | 0.158 |
| 1891.4 | 0.15 |
| 1891.5 | 0.144 |
| 1891.6 | 0.143 |
| 1891.7 | 0.148 |
| 1891.8 | 0.153 |
| 1891.9 | 0.161 |
| 1892.0 | 0.163 |
| 1892.1 | 0.166 |
| 1892.2 | 0.159 |
| 1892.3 | 0.148 |
| 1892.4 | 0.134 |
| 1892.5 | 0.121 |
| 1892.6 | 0.107 |
| 1892.7 | 0.096 |
| 1892.8 | 0.095 |
| 1892.9 | 0.095 |
| 1893.0 | 0.105 |
| 1893.1 | 0.108 |
| 1893.2 | 0.118 |
| 1893.3 | 0.132 |
| 1893.4 | 0.152 |
| 1893.5 | 0.169 |
| 1893.6 | 0.195 |
| 1893.7 | 0.218 |
| 1893.8 | 0.24 |
| 1893.9 | 0.256 |
| 1894.0 | 0.271 |
| 1894.1 | 0.279 |
| 1894.2 | 0.284 |
| 1894.3 | 0.279 |
| 1894.4 | 0.272 |
| 1894.5 | 0.261 |
| 1894.6 | 0.245 |
| 1894.7 | 0.227 |
| 1894.8 | 0.214 |
| 1894.9 | 0.193 |
| 1895.0 | 0.17 |
| 1895.1 | 0.152 |
| 1895.2 | 0.135 |
| 1895.3 | 0.119 |
| 1895.4 | 0.107 |
| 1895.5 | 0.101 |
| 1895.6 | 0.091 |
| 1895.7 | 0.085 |
| 1895.8 | 0.076 |
| 1895.9 | 0.077 |
| 1896.0 | 0.074 |
| 1896.1 | 0.071 |
| 1896.2 | 0.069 |
| 1896.3 | 0.065 |
| 1896.4 | 0.056 |
| 1896.5 | 0.049 |
| 1896.6 | 0.046 |
| 1896.7 | 0.047 |
| 1896.8 | 0.047 |
| 1896.9 | 0.041 |
| 1897.0 | 0.044 |
| 1897.1 | 0.049 |
| 1897.2 | 0.056 |
| 1897.3 | 0.063 |
| 1897.4 | 0.079 |
| 1897.5 | 0.095 |
| 1897.6 | 0.105 |
| 1897.7 | 0.111 |
| 1897.8 | 0.123 |
| 1897.9 | 0.133 |
| 1898.0 | 0.13 |
| 1898.1 | 0.129 |
| 1898.2 | 0.124 |
| 1898.3 | 0.119 |
| 1898.4 | 0.105 |
| 1898.5 | 0.101 |
| 1898.6 | 0.089 |
| 1898.7 | 0.082 |
| 1898.8 | 0.073 |
| 1898.9 | 0.075 |
| 1899.0 | 0.075 |
| 1899.1 | 0.088 |
| 1899.2 | 0.1 |
| 1899.3 | 0.116 |
| 1899.4 | 0.131 |
| 1899.5 | 0.162 |
| 1899.6 | 0.186 |
| 1899.7 | 0.211 |
| 1899.8 | 0.237 |
| 1899.9 | 0.274 |
| 1900.0 | 0.292 |
| 1900.1 | 0.314 |
| 1900.2 | 0.338 |
| 1900.3 | 0.371 |
| 1900.4 | 0.392 |
| 1900.5 | 0.415 |
| 1900.6 | 0.447 |
| 1900.7 | 0.473 |
| 1900.8 | 0.484 |
| 1900.9 | 0.497 |
| 1901.0 | 0.507 |
| 1901.1 | 0.51 |
| 1901.2 | 0.507 |
| 1901.3 | 0.501 |
| 1901.4 | 0.478 |
| 1901.5 | 0.45 |
| 1901.6 | 0.416 |
| 1901.7 | 0.384 |
| 1901.8 | 0.349 |
| 1901.9 | 0.312 |
| 1902.0 | 0.285 |
| 1902.1 | 0.248 |
| 1902.2 | 0.216 |
| 1902.3 | 0.181 |
| 1902.4 | 0.151 |
| 1902.5 | 0.131 |
| 1902.6 | 0.124 |
| 1902.7 | 0.121 |
| 1902.8 | 0.129 |
| 1902.9 | 0.158 |
| 1903.0 | 0.183 |
| 1903.1 | 0.218 |
| 1903.2 | 0.249 |
| 1903.3 | 0.28 |
| 1903.4 | 0.303 |
| 1903.5 | 0.32 |
| 1903.6 | 0.328 |
| 1903.7 | 0.336 |
| 1903.8 | 0.348 |
| 1903.9 | 0.355 |
| 1904.0 | 0.362 |
| 1904.1 | 0.375 |
| 1904.2 | 0.398 |
| 1904.3 | 0.41 |
| 1904.4 | 0.431 |
| 1904.5 | 0.465 |
| 1904.6 | 0.495 |
| 1904.7 | 0.518 |
| 1904.8 | 0.557 |
| 1904.9 | 0.594 |
| 1905.0 | 0.625 |
| 1905.1 | 0.678 |
| 1905.2 | 0.768 |
| 1905.3 | 0.863 |
| 1905.4 | 0.96 |
| 1905.5 | 1.067 |
| 1905.6 | 1.177 |
| 1905.7 | 1.236 |
| 1905.8 | 1.304 |
| 1905.9 | 1.361 |
| 1906.0 | 1.4 |
| 1906.1 | 1.407 |
| 1906.2 | 1.408 |
| 1906.3 | 1.377 |
| 1906.4 | 1.368 |
| 1906.5 | 1.378 |
| 1906.6 | 1.377 |
| 1906.7 | 1.399 |
| 1906.8 | 1.432 |
| 1906.9 | 1.461 |
| 1907.0 | 1.482 |
| 1907.1 | 1.509 |
| 1907.2 | 1.514 |
| 1907.3 | 1.523 |
| 1907.4 | 1.513 |
| 1907.5 | 1.483 |
| 1907.6 | 1.463 |
| 1907.7 | 1.434 |
| 1907.8 | 1.375 |
| 1907.9 | 1.315 |
| 1908.0 | 1.267 |
| 1908.1 | 1.217 |
| 1908.2 | 1.159 |
| 1908.3 | 1.117 |
| 1908.4 | 1.083 |
| 1908.5 | 1.035 |
| 1908.6 | 1.004 |
| 1908.7 | 0.99 |
| 1908.8 | 0.982 |
| 1908.9 | 0.976 |
| 1909.0 | 0.996 |
| 1909.1 | 0.987 |
| 1909.2 | 0.988 |
| 1909.3 | 0.972 |
| 1909.4 | 0.949 |
| 1909.5 | 0.919 |
| 1909.6 | 0.879 |
| 1909.7 | 0.82 |
| 1909.8 | 0.768 |
| 1909.9 | 0.711 |
| 1910.0 | 0.653 |
| 1910.1 | 0.605 |
| 1910.2 | 0.56 |
| 1910.3 | 0.518 |
| 1910.4 | 0.495 |
| 1910.5 | 0.463 |
| 1910.6 | 0.444 |
| 1910.7 | 0.434 |
| 1910.8 | 0.423 |
| 1910.9 | 0.411 |
| 1911.0 | 0.4 |
| 1911.1 | 0.394 |
| 1911.2 | 0.381 |
| 1911.3 | 0.384 |
| 1911.4 | 0.379 |
| 1911.5 | 0.389 |
| 1911.6 | 0.396 |
| 1911.7 | 0.409 |
| 1911.8 | 0.414 |
| 1911.9 | 0.435 |
| 1912.0 | 0.451 |
| 1912.1 | 0.471 |
| 1912.2 | 0.489 |
| 1912.3 | 0.501 |
| 1912.4 | 0.508 |
| 1912.5 | 0.513 |
| 1912.6 | 0.518 |
| 1912.7 | 0.52 |
| 1912.8 | 0.526 |
| 1912.9 | 0.525 |
| 1913.0 | 0.52 |
| 1913.1 | 0.521 |
| 1913.2 | 0.536 |
| 1913.3 | 0.553 |
| 1913.4 | 0.578 |
| 1913.5 | 0.62 |
| 1913.6 | 0.66 |
| 1913.7 | 0.7 |
| 1913.8 | 0.742 |
| 1913.9 | 0.776 |
| 1914.0 | 0.799 |
| 1914.1 | 0.809 |
| 1914.2 | 0.801 |
| 1914.3 | 0.789 |
| 1914.4 | 0.761 |
| 1914.5 | 0.71 |
| 1914.6 | 0.65 |
| 1914.7 | 0.59 |
| 1914.8 | 0.532 |
| 1914.9 | 0.463 |
| 1915.0 | 0.408 |
| 1915.1 | 0.361 |
| 1915.2 | 0.314 |
| 1915.3 | 0.266 |
| 1915.4 | 0.234 |
| 1915.5 | 0.211 |
| 1915.6 | 0.184 |
| 1915.7 | 0.168 |
| 1915.8 | 0.152 |
| 1915.9 | 0.143 |
| 1916.0 | 0.133 |
| 1916.1 | 0.132 |
| 1916.2 | 0.13 |
| 1916.3 | 0.136 |
| 1916.4 | 0.15 |
| 1916.5 | 0.161 |
| 1916.6 | 0.178 |
| 1916.7 | 0.193 |
| 1916.8 | 0.207 |
| 1916.9 | 0.217 |
| 1917.0 | 0.241 |
| 1917.1 | 0.25 |
| 1917.2 | 0.27 |
| 1917.3 | 0.288 |
| 1917.4 | 0.311 |
| 1917.5 | 0.316 |
| 1917.6 | 0.334 |
| 1917.7 | 0.359 |
| 1917.8 | 0.382 |
| 1917.9 | 0.404 |
| 1918.0 | 0.435 |
| 1918.1 | 0.47 |
| 1918.2 | 0.497 |
| 1918.3 | 0.531 |
| 1918.4 | 0.555 |
| 1918.5 | 0.585 |
| 1918.6 | 0.608 |
| 1918.7 | 0.626 |
| 1918.8 | 0.631 |
| 1918.9 | 0.63 |
| 1919.0 | 0.614 |
| 1919.1 | 0.599 |
| 1919.2 | 0.579 |
| 1919.3 | 0.556 |
| 1919.4 | 0.537 |
| 1919.5 | 0.535 |
| 1919.6 | 0.516 |
| 1919.7 | 0.496 |
| 1919.8 | 0.482 |
| 1919.9 | 0.463 |
| 1920.0 | 0.427 |
| 1920.1 | 0.404 |
| 1920.2 | 0.379 |
| 1920.3 | 0.358 |
| 1920.4 | 0.337 |
| 1920.5 | 0.33 |
| 1920.6 | 0.316 |
| 1920.7 | 0.307 |
| 1920.8 | 0.308 |
| 1920.9 | 0.311 |
| 1921.0 | 0.311 |
| 1921.1 | 0.321 |
| 1921.2 | 0.332 |
| 1921.3 | 0.337 |
| 1921.4 | 0.341 |
| 1921.5 | 0.341 |
| 1921.6 | 0.325 |
| 1921.7 | 0.307 |
| 1921.8 | 0.283 |
| 1921.9 | 0.259 |
| 1922.0 | 0.235 |
| 1922.1 | 0.217 |
| 1922.2 | 0.2 |
| 1922.3 | 0.195 |
| 1922.4 | 0.192 |
| 1922.5 | 0.191 |
| 1922.6 | 0.199 |
| 1922.7 | 0.201 |
| 1922.8 | 0.202 |
| 1922.9 | 0.202 |
| 1923.0 | 0.209 |
| 1923.1 | 0.212 |
| 1923.2 | 0.216 |
| 1923.3 | 0.209 |
| 1923.4 | 0.207 |
| 1923.5 | 0.2 |
| 1923.6 | 0.186 |
| 1923.7 | 0.184 |
| 1923.8 | 0.188 |
| 1923.9 | 0.186 |
| 1924.0 | 0.195 |
| 1924.1 | 0.213 |
| 1924.2 | 0.222 |
| 1924.3 | 0.245 |
| 1924.4 | 0.278 |
| 1924.5 | 0.317 |
| 1924.6 | 0.348 |
| 1924.7 | 0.404 |
| 1924.8 | 0.448 |
| 1924.9 | 0.496 |
| 1925.0 | 0.523 |
| 1925.1 | 0.555 |
| 1925.2 | 0.562 |
| 1925.3 | 0.556 |
| 1925.4 | 0.536 |
| 1925.5 | 0.51 |
| 1925.6 | 0.472 |
| 1925.7 | 0.438 |
| 1925.8 | 0.409 |
| 1925.9 | 0.378 |
| 1926.0 | 0.344 |
| 1926.1 | 0.32 |
| 1926.2 | 0.288 |
| 1926.3 | 0.266 |
| 1926.4 | 0.248 |
| 1926.5 | 0.241 |
| 1926.6 | 0.235 |
| 1926.7 | 0.238 |
| 1926.8 | 0.236 |
| 1926.9 | 0.245 |
| 1927.0 | 0.258 |
| 1927.1 | 0.277 |
| 1927.2 | 0.304 |
| 1927.3 | 0.34 |
| 1927.4 | 0.374 |
| 1927.5 | 0.419 |
| 1927.6 | 0.485 |
| 1927.7 | 0.543 |
| 1927.8 | 0.601 |
| 1927.9 | 0.665 |
| 1928.0 | 0.722 |
| 1928.1 | 0.756 |
| 1928.2 | 0.789 |
| 1928.3 | 0.817 |
| 1928.4 | 0.836 |
| 1928.5 | 0.849 |
| 1928.6 | 0.847 |
| 1928.7 | 0.831 |
| 1928.8 | 0.81 |
| 1928.9 | 0.762 |
| 1929.0 | 0.722 |
| 1929.1 | 0.688 |
| 1929.2 | 0.65 |
| 1929.3 | 0.598 |
| 1929.4 | 0.563 |
| 1929.5 | 0.51 |
| 1929.6 | 0.453 |
| 1929.7 | 0.412 |
| 1929.8 | 0.376 |
| 1929.9 | 0.342 |
| 1930.0 | 0.316 |
| 1930.1 | 0.292 |
| 1930.2 | 0.26 |
| 1930.3 | 0.247 |
| 1930.4 | 0.231 |
| 1930.5 | 0.224 |
| 1930.6 | 0.223 |
| 1930.7 | 0.234 |
| 1930.8 | 0.25 |
| 1930.9 | 0.269 |
| 1931.0 | 0.299 |
| 1931.1 | 0.326 |
| 1931.2 | 0.359 |
| 1931.3 | 0.391 |
| 1931.4 | 0.43 |
| 1931.5 | 0.468 |
| 1931.6 | 0.518 |
| 1931.7 | 0.573 |
| 1931.8 | 0.623 |
| 1931.9 | 0.689 |
| 1932.0 | 0.75 |
| 1932.1 | 0.813 |
| 1932.2 | 0.868 |
| 1932.3 | 0.914 |
| 1932.4 | 0.936 |
| 1932.5 | 0.945 |
| 1932.6 | 0.944 |
| 1932.7 | 0.911 |
| 1932.8 | 0.891 |
| 1932.9 | 0.849 |
| 1933.0 | 0.795 |
| 1933.1 | 0.732 |
| 1933.2 | 0.68 |
| 1933.3 | 0.6 |
| 1933.4 | 0.532 |
| 1933.5 | 0.475 |
| 1933.6 | 0.415 |
| 1933.7 | 0.36 |
| 1933.8 | 0.317 |
| 1933.9 | 0.282 |
| 1934.0 | 0.24 |
| 1934.1 | 0.211 |
| 1934.2 | 0.189 |
| 1934.3 | 0.171 |
| 1934.4 | 0.163 |
| 1934.5 | 0.16 |
| 1934.6 | 0.158 |
| 1934.7 | 0.164 |
| 1934.8 | 0.172 |
| 1934.9 | 0.174 |
| 1935.0 | 0.181 |
| 1935.1 | 0.186 |
| 1935.2 | 0.194 |
| 1935.3 | 0.206 |
| 1935.4 | 0.215 |
| 1935.5 | 0.232 |
| 1935.6 | 0.259 |
| 1935.7 | 0.279 |
| 1935.8 | 0.298 |
| 1935.9 | 0.323 |
| 1936.0 | 0.34 |
| 1936.1 | 0.348 |
| 1936.2 | 0.355 |
| 1936.3 | 0.358 |
| 1936.4 | 0.355 |
| 1936.5 | 0.339 |
| 1936.6 | 0.327 |
| 1936.7 | 0.308 |
| 1936.8 | 0.285 |
| 1936.9 | 0.266 |
| 1937.0 | 0.246 |
| 1937.1 | 0.233 |
| 1937.2 | 0.222 |
| 1937.3 | 0.21 |
| 1937.4 | 0.193 |
| 1937.5 | 0.189 |
| 1937.6 | 0.178 |
| 1937.7 | 0.166 |
| 1937.8 | 0.164 |
| 1937.9 | 0.166 |
| 1938.0 | 0.165 |
| 1938.1 | 0.168 |
| 1938.2 | 0.175 |
| 1938.3 | 0.182 |
| 1938.4 | 0.194 |
| 1938.5 | 0.215 |
| 1938.6 | 0.23 |
| 1938.7 | 0.252 |
| 1938.8 | 0.264 |
| 1938.9 | 0.288 |
| 1939.0 | 0.311 |
| 1939.1 | 0.338 |
| 1939.2 | 0.363 |
| 1939.3 | 0.399 |
| 1939.4 | 0.418 |
| 1939.5 | 0.427 |
| 1939.6 | 0.435 |
| 1939.7 | 0.436 |
| 1939.8 | 0.428 |
| 1939.9 | 0.425 |
| 1940.0 | 0.417 |
| 1940.1 | 0.411 |
| 1940.2 | 0.404 |
| 1940.3 | 0.389 |
| 1940.4 | 0.375 |
| 1940.5 | 0.367 |
| 1940.6 | 0.342 |
| 1940.7 | 0.316 |
| 1940.8 | 0.293 |
| 1940.9 | 0.263 |
| 1941.0 | 0.228 |
| 1941.1 | 0.208 |
| 1941.2 | 0.191 |
| 1941.3 | 0.179 |
| 1941.4 | 0.162 |
| 1941.5 | 0.149 |
| 1941.6 | 0.139 |
| 1941.7 | 0.134 |
| 1941.8 | 0.13 |
| 1941.9 | 0.137 |
| 1942.0 | 0.149 |
| 1942.1 | 0.154 |
| 1942.2 | 0.159 |
| 1942.3 | 0.172 |
| 1942.4 | 0.178 |
| 1942.5 | 0.185 |
| 1942.6 | 0.193 |
| 1942.7 | 0.192 |
| 1942.8 | 0.196 |
| 1942.9 | 0.202 |
| 1943.0 | 0.199 |
| 1943.1 | 0.195 |
| 1943.2 | 0.202 |
| 1943.3 | 0.193 |
| 1943.4 | 0.182 |
| 1943.5 | 0.172 |
| 1943.6 | 0.158 |
| 1943.7 | 0.14 |
| 1943.8 | 0.129 |
| 1943.9 | 0.119 |
| 1944.0 | 0.111 |
| 1944.1 | 0.111 |
| 1944.2 | 0.11 |
| 1944.3 | 0.102 |
| 1944.4 | 0.097 |
| 1944.5 | 0.095 |
| 1944.6 | 0.091 |
| 1944.7 | 0.089 |
| 1944.8 | 0.092 |
| 1944.9 | 0.097 |
| 1945.0 | 0.103 |
| 1945.1 | 0.105 |
| 1945.2 | 0.112 |
| 1945.3 | 0.116 |
| 1945.4 | 0.125 |
| 1945.5 | 0.137 |
| 1945.6 | 0.157 |
| 1945.7 | 0.176 |
| 1945.8 | 0.196 |
| 1945.9 | 0.219 |
| 1946.0 | 0.232 |
| 1946.1 | 0.24 |
| 1946.2 | 0.25 |
| 1946.3 | 0.257 |
| 1946.4 | 0.26 |
| 1946.5 | 0.268 |
| 1946.6 | 0.275 |
| 1946.7 | 0.275 |
| 1946.8 | 0.269 |
| 1946.9 | 0.261 |
| 1947.0 | 0.26 |
| 1947.1 | 0.256 |
| 1947.2 | 0.251 |
| 1947.3 | 0.248 |
| 1947.4 | 0.235 |
| 1947.5 | 0.221 |
| 1947.6 | 0.202 |
| 1947.7 | 0.183 |
| 1947.8 | 0.171 |
| 1947.9 | 0.162 |
| 1948.0 | 0.144 |
| 1948.1 | 0.129 |
| 1948.2 | 0.116 |
| 1948.3 | 0.104 |
| 1948.4 | 0.096 |
| 1948.5 | 0.086 |
| 1948.6 | 0.086 |
| 1948.7 | 0.081 |
| 1948.8 | 0.076 |
| 1948.9 | 0.07 |
| 1949.0 | 0.068 |
| 1949.1 | 0.062 |
| 1949.2 | 0.055 |
| 1949.3 | 0.051 |
| 1949.4 | 0.05 |
| 1949.5 | 0.051 |
| 1949.6 | 0.048 |
| 1949.7 | 0.054 |
| 1949.8 | 0.053 |
| 1949.9 | 0.053 |
| 1950.0 | 0.052 |
| 1950.1 | 0.055 |
| 1950.2 | 0.051 |
| 1950.3 | 0.052 |
| 1950.4 | 0.05 |
| 1950.5 | 0.049 |
| 1950.6 | 0.038 |
| 1950.7 | 0.034 |
| 1950.8 | 0.032 |
| 1950.9 | 0.029 |
| 1951.0 | 0.027 |
| 1951.1 | 0.036 |
| 1951.2 | 0.037 |
| 1951.3 | 0.037 |
| 1951.4 | 0.044 |
| 1951.5 | 0.042 |
| 1951.6 | 0.042 |
| 1951.7 | 0.044 |
| 1951.8 | 0.041 |
| 1951.9 | 0.041 |
| 1952.0 | 0.038 |
| 1952.1 | 0.039 |
| 1952.2 | 0.041 |
| 1952.3 | 0.04 |
| 1952.4 | 0.033 |
| 1952.5 | 0.033 |
| 1952.6 | 0.028 |
| 1952.7 | 0.027 |
| 1952.8 | 0.026 |
| 1952.9 | 0.029 |
| 1953.0 | 0.029 |
| 1953.1 | 0.032 |
| 1953.2 | 0.034 |
| 1953.3 | 0.033 |
| 1953.4 | 0.035 |
| 1953.5 | 0.043 |
| 1953.6 | 0.04 |
| 1953.7 | 0.036 |
| 1953.8 | 0.036 |
| 1953.9 | 0.025 |
| 1954.0 | 0.016 |
| 1954.1 | 0.021 |
| 1954.2 | 0.024 |
| 1954.3 | 0.025 |
| 1954.4 | 0.031 |
| 1954.5 | 0.035 |
| 1954.6 | 0.032 |
| 1954.7 | 0.035 |
| 1954.8 | 0.041 |
| 1954.9 | 0.048 |
| 1955.0 | 0.053 |
| 1955.1 | 0.052 |
| 1955.2 | 0.051 |
| 1955.3 | 0.049 |
| 1955.4 | 0.045 |
| 1955.5 | 0.042 |
| 1955.6 | 0.046 |
| 1955.7 | 0.039 |
| 1955.8 | 0.042 |
| 1955.9 | 0.04 |
| 1956.0 | 0.041 |
| 1956.1 | 0.042 |
| 1956.2 | 0.045 |
| 1956.3 | 0.039 |
| 1956.4 | 0.043 |
| 1956.5 | 0.037 |
| 1956.6 | 0.032 |
| 1956.7 | 0.031 |
| 1956.8 | 0.026 |
| 1956.9 | 0.023 |
| 1957.0 | 0.028 |
| 1957.1 | 0.027 |
| 1957.2 | 0.028 |
| 1957.3 | 0.036 |
| 1957.4 | 0.031 |
| 1957.5 | 0.038 |
| 1957.6 | 0.042 |
| 1957.7 | 0.038 |
| 1957.8 | 0.041 |
| 1957.9 | 0.045 |
| 1958.0 | 0.038 |
| 1958.1 | 0.037 |
| 1958.2 | 0.046 |
| 1958.3 | 0.044 |
| 1958.4 | 0.047 |
| 1958.5 | 0.05 |
| 1958.6 | 0.046 |
| 1958.7 | 0.051 |
| 1958.8 | 0.05 |
| 1958.9 | 0.054 |
| 1959.0 | 0.049 |
| 1959.1 | 0.054 |
| 1959.2 | 0.046 |
| 1959.3 | 0.047 |
| 1959.4 | 0.051 |
| 1959.5 | 0.057 |
| 1959.6 | 0.058 |
| 1959.7 | 0.063 |
| 1959.8 | 0.073 |
| 1959.9 | 0.075 |
| 1960.0 | 0.075 |
| 1960.1 | 0.08 |
| 1960.2 | 0.085 |
| 1960.3 | 0.084 |
| 1960.4 | 0.08 |
| 1960.5 | 0.073 |
| 1960.6 | 0.071 |
| 1960.7 | 0.064 |
| 1960.8 | 0.061 |
| 1960.9 | 0.062 |
| 1961.0 | 0.07 |
| 1961.1 | 0.071 |
| 1961.2 | 0.071 |
| 1961.3 | 0.064 |
| 1961.4 | 0.061 |
| 1961.5 | 0.056 |
| 1961.6 | 0.047 |
| 1961.7 | 0.055 |
| 1961.8 | 0.057 |
| 1961.9 | 0.058 |
| 1962.0 | 0.062 |
| 1962.1 | 0.068 |
| 1962.2 | 0.066 |
| 1962.3 | 0.076 |
| 1962.4 | 0.082 |
| 1962.5 | 0.081 |
| 1962.6 | 0.081 |
| 1962.7 | 0.077 |
| 1962.8 | 0.069 |
| 1962.9 | 0.064 |
| 1963.0 | 0.061 |
| 1963.1 | 0.056 |
| 1963.2 | 0.058 |
| 1963.3 | 0.052 |
| 1963.4 | 0.051 |
| 1963.5 | 0.053 |
| 1963.6 | 0.053 |
| 1963.7 | 0.053 |
| 1963.8 | 0.054 |
| 1963.9 | 0.047 |
| 1964.0 | 0.05 |
| 1964.1 | 0.051 |
| 1964.2 | 0.053 |
| 1964.3 | 0.057 |
| 1964.4 | 0.068 |
| 1964.5 | 0.064 |
| 1964.6 | 0.069 |
| 1964.7 | 0.074 |
| 1964.8 | 0.079 |
| 1964.9 | 0.076 |
| 1965.0 | 0.078 |
| 1965.1 | 0.073 |
| 1965.2 | 0.072 |
| 1965.3 | 0.078 |
| 1965.4 | 0.094 |
| 1965.5 | 0.104 |
| 1965.6 | 0.121 |
| 1965.7 | 0.136 |
| 1965.8 | 0.142 |
| 1965.9 | 0.149 |
| 1966.0 | 0.156 |
| 1966.1 | 0.161 |
| 1966.2 | 0.156 |
| 1966.3 | 0.164 |
| 1966.4 | 0.159 |
| 1966.5 | 0.159 |
| 1966.6 | 0.159 |
| 1966.7 | 0.171 |
| 1966.8 | 0.169 |
| 1966.9 | 0.168 |
| 1967.0 | 0.163 |
| 1967.1 | 0.158 |
| 1967.2 | 0.148 |
| 1967.3 | 0.137 |
| 1967.4 | 0.132 |
| 1967.5 | 0.138 |
| 1967.6 | 0.14 |
| 1967.7 | 0.141 |
| 1967.8 | 0.142 |
| 1967.9 | 0.149 |
| 1968.0 | 0.147 |
| 1968.1 | 0.148 |
| 1968.2 | 0.144 |
| 1968.3 | 0.146 |
| 1968.4 | 0.148 |
| 1968.5 | 0.142 |
| 1968.6 | 0.141 |
| 1968.7 | 0.139 |
| 1968.8 | 0.138 |
| 1968.9 | 0.128 |
| 1969.0 | 0.126 |
| 1969.1 | 0.118 |
| 1969.2 | 0.115 |
| 1969.3 | 0.109 |
| 1969.4 | 0.104 |
| 1969.5 | 0.094 |
| 1969.6 | 0.089 |
| 1969.7 | 0.082 |
| 1969.8 | 0.07 |
| 1969.9 | 0.066 |
| 1970.0 | 0.061 |
| 1970.1 | 0.061 |
| 1970.2 | 0.055 |
| 1970.3 | 0.051 |
| 1970.4 | 0.047 |
| 1970.5 | 0.05 |
| 1970.6 | 0.048 |
| 1970.7 | 0.052 |
| 1970.8 | 0.052 |
| 1970.9 | 0.053 |
| 1971.0 | 0.053 |
| 1971.1 | 0.052 |
| 1971.2 | 0.054 |
| 1971.3 | 0.053 |
| 1971.4 | 0.058 |
| 1971.5 | 0.061 |
| 1971.6 | 0.065 |
| 1971.7 | 0.067 |
| 1971.8 | 0.072 |
| 1971.9 | 0.075 |
| 1972.0 | 0.072 |
| 1972.1 | 0.072 |
| 1972.2 | 0.073 |
| 1972.3 | 0.089 |
| 1972.4 | 0.096 |
| 1972.5 | 0.108 |
| 1972.6 | 0.123 |
| 1972.7 | 0.139 |
| 1972.8 | 0.148 |
| 1972.9 | 0.165 |
| 1973.0 | 0.183 |
| 1973.1 | 0.195 |
| 1973.2 | 0.21 |
| 1973.3 | 0.22 |
| 1973.4 | 0.228 |
| 1973.5 | 0.231 |
| 1973.6 | 0.232 |
| 1973.7 | 0.228 |
| 1973.8 | 0.224 |
| 1973.9 | 0.214 |
| 1974.0 | 0.199 |
| 1974.1 | 0.187 |
| 1974.2 | 0.171 |
| 1974.3 | 0.161 |
| 1974.4 | 0.148 |
| 1974.5 | 0.143 |
| 1974.6 | 0.133 |
| 1974.7 | 0.123 |
| 1974.8 | 0.108 |
| 1974.9 | 0.096 |
| 1975.0 | 0.084 |
| 1975.1 | 0.078 |
| 1975.2 | 0.069 |
| 1975.3 | 0.066 |
| 1975.4 | 0.064 |
| 1975.5 | 0.063 |
| 1975.6 | 0.059 |
| 1975.7 | 0.066 |
| 1975.8 | 0.068 |
| 1975.9 | 0.061 |
| 1976.0 | 0.056 |
| 1976.1 | 0.05 |
| 1976.2 | 0.049 |
| 1976.3 | 0.038 |
| 1976.4 | 0.046 |
| 1976.5 | 0.049 |
| 1976.6 | 0.056 |
| 1976.7 | 0.047 |
| 1976.8 | 0.053 |
| 1976.9 | 0.05 |
| 1977.0 | 0.055 |
| 1977.1 | 0.048 |
| 1977.2 | 0.054 |
| 1977.3 | 0.048 |
| 1977.4 | 0.044 |
| 1977.5 | 0.041 |
| 1977.6 | 0.041 |
| 1977.7 | 0.033 |
| 1977.8 | 0.033 |
| 1977.9 | 0.027 |
| 1978.0 | 0.024 |
| 1978.1 | 0.024 |
| 1978.2 | 0.029 |
| 1978.3 | 0.03 |
| 1978.4 | 0.037 |
| 1978.5 | 0.038 |
| 1978.6 | 0.037 |
| 1978.7 | 0.039 |
| 1978.8 | 0.037 |
| 1978.9 | 0.031 |
| 1979.0 | 0.033 |
| 1979.1 | 0.04 |
| 1979.2 | 0.035 |
| 1979.3 | 0.041 |
| 1979.4 | 0.045 |
| 1979.5 | 0.041 |
| 1979.6 | 0.031 |
| 1979.7 | 0.029 |
| 1979.8 | 0.025 |
| 1979.9 | 0.026 |
| 1980.0 | 0.03 |
| 1980.1 | 0.033 |
| 1980.2 | 0.04 |
| 1980.3 | 0.043 |
| 1980.4 | 0.043 |
| 1980.5 | 0.04 |
| 1980.6 | 0.037 |
| 1980.7 | 0.041 |
| 1980.8 | 0.04 |
| 1980.9 | 0.042 |
| 1981.0 | 0.044 |
| 1981.1 | 0.05 |
| 1981.2 | 0.044 |
| 1981.3 | 0.039 |
| 1981.4 | 0.032 |
| 1981.5 | 0.026 |
| 1981.6 | 0.026 |
| 1981.7 | 0.021 |
| 1981.8 | 0.022 |
| 1981.9 | 0.023 |
| 1982.0 | 0.027 |
| 1982.1 | 0.022 |
| 1982.2 | 0.028 |
| 1982.3 | 0.034 |
| 1982.4 | 0.039 |
| 1982.5 | 0.04 |
| 1982.6 | 0.044 |
| 1982.7 | 0.042 |
| 1982.8 | 0.043 |
| 1982.9 | 0.041 |
| 1983.0 | 0.04 |
| 1983.1 | 0.037 |
| 1983.2 | 0.038 |
| 1983.3 | 0.034 |
| 1983.4 | 0.031 |
| 1983.5 | 0.027 |
| 1983.6 | 0.038 |
| 1983.7 | 0.033 |
| 1983.8 | 0.033 |
| 1983.9 | 0.034 |
| 1984.0 | 0.044 |
| 1984.1 | 0.033 |
| 1984.2 | 0.036 |
| 1984.3 | 0.033 |
| 1984.4 | 0.026 |
| 1984.5 | 0.02 |
| 1984.6 | 0.028 |
| 1984.7 | 0.031 |
| 1984.8 | 0.035 |
| 1984.9 | 0.042 |
| 1985.0 | 0.045 |
| 1985.1 | 0.038 |
| 1985.2 | 0.04 |
| 1985.3 | 0.043 |
| 1985.4 | 0.046 |
| 1985.5 | 0.044 |
| 1985.6 | 0.048 |
| 1985.7 | 0.044 |
| 1985.8 | 0.037 |
| 1985.9 | 0.038 |
| 1986.0 | 0.039 |
| 1986.1 | 0.035 |
| 1986.2 | 0.036 |
| 1986.3 | 0.042 |
| 1986.4 | 0.04 |
| 1986.5 | 0.036 |
| 1986.6 | 0.043 |
| 1986.7 | 0.043 |
| 1986.8 | 0.041 |
| 1986.9 | 0.041 |
| 1987.0 | 0.046 |
| 1987.1 | 0.042 |
| 1987.2 | 0.035 |
| 1987.3 | 0.04 |
| 1987.4 | 0.041 |
| 1987.5 | 0.037 |
| 1987.6 | 0.038 |
| 1987.7 | 0.049 |
| 1987.8 | 0.043 |
| 1987.9 | 0.041 |
| 1988.0 | 0.039 |
| 1988.1 | 0.032 |
| 1988.2 | 0.031 |
| 1988.3 | 0.035 |
| 1988.4 | 0.031 |
| 1988.5 | 0.032 |
| 1988.6 | 0.044 |
| 1988.7 | 0.045 |
| 1988.8 | 0.045 |
| 1988.9 | 0.049 |
| 1989.0 | 0.053 |
| 1989.1 | 0.05 |
| 1989.2 | 0.039 |
| 1989.3 | 0.034 |
| 1989.4 | 0.033 |
| 1989.5 | 0.031 |
| 1989.6 | 0.026 |
| 1989.7 | 0.03 |
| 1989.8 | 0.034 |
| 1989.9 | 0.031 |
| 1990.0 | 0.034 |
| 1990.1 | 0.034 |
| 1990.2 | 0.035 |
| 1990.3 | 0.032 |
| 1990.4 | 0.032 |
| 1990.5 | 0.032 |
| 1990.6 | 0.034 |
| 1990.7 | 0.038 |
| 1990.8 | 0.039 |
| 1990.9 | 0.039 |
| 1991.0 | 0.036 |
| 1991.1 | 0.034 |
| 1991.2 | 0.029 |
| 1991.3 | 0.027 |
| 1991.4 | 0.026 |
| 1991.5 | 0.022 |
| 1991.6 | 0.028 |
| 1991.7 | 0.027 |
| 1991.8 | 0.028 |
| 1991.9 | 0.032 |
| 1992.0 | 0.032 |
| 1992.1 | 0.027 |
| 1992.2 | 0.028 |
| 1992.3 | 0.032 |
| 1992.4 | 0.027 |
| 1992.5 | 0.031 |
| 1992.6 | 0.037 |
| 1992.7 | 0.036 |
| 1992.8 | 0.03 |
| 1992.9 | 0.029 |
| 1993.0 | 0.026 |
| 1993.1 | 0.022 |
| 1993.2 | 0.027 |
| 1993.3 | 0.029 |
| 1993.4 | 0.031 |
| 1993.5 | 0.029 |
| 1993.6 | 0.026 |
| 1993.7 | 0.027 |
| 1993.8 | 0.03 |
| 1993.9 | 0.034 |
| 1994.0 | 0.044 |
| 1994.1 | 0.04 |
| 1994.2 | 0.038 |
| 1994.3 | 0.034 |
| 1994.4 | 0.036 |
| 1994.5 | 0.03 |
| 1994.6 | 0.042 |
| 1994.7 | 0.041 |
| 1994.8 | 0.034 |
| 1994.9 | 0.031 |
| 1995.0 | 0.03 |
| 1995.1 | 0.018 |
| 1995.2 | 0.022 |
| 1995.3 | 0.025 |
| 1995.4 | 0.021 |
| 1995.5 | 0.022 |
| 1995.6 | 0.031 |
| 1995.7 | 0.027 |
| 1995.8 | 0.03 |
| 1995.9 | 0.036 |
| 1996.0 | 0.039 |
| 1996.1 | 0.034 |
| 1996.2 | 0.036 |
| 1996.3 | 0.036 |
| 1996.4 | 0.035 |
| 1996.5 | 0.033 |
| 1996.6 | 0.04 |
| 1996.7 | 0.047 |
| 1996.8 | 0.046 |
| 1996.9 | 0.047 |
| 1997.0 | 0.049 |
| 1997.1 | 0.041 |
| 1997.2 | 0.038 |
| 1997.3 | 0.042 |
| 1997.4 | 0.039 |
| 1997.5 | 0.037 |
| 1997.6 | 0.043 |
| 1997.7 | 0.041 |
| 1997.8 | 0.038 |
| 1997.9 | 0.04 |
| 1998.0 | 0.029 |
| 1998.1 | 0.021 |
| 1998.2 | 0.02 |
| 1998.3 | 0.019 |
| 1998.4 | 0.016 |
| 1998.5 | 0.026 |
| 1998.6 | 0.024 |
| 1998.7 | 0.02 |
| 1998.8 | 0.013 |
| 1998.9 | 0.014 |
| 1999.0 | 0.015 |
| 1999.1 | 0.022 |
| 1999.2 | 0.029 |
| 1999.3 | 0.042 |
| 1999.4 | 0.046 |
| 1999.5 | 0.044 |
| 1999.6 | 0.046 |
| 1999.7 | 0.045 |
| 1999.8 | 0.045 |
| 1999.9 | 0.043 |
| 2000.0 | 0.008 |
| 2000.1 | 0.006 |
| 2000.2 | 0.004 |
| 2000.3 | 0.006 |
| 2000.4 | 0.009 |
| 2000.5 | 0.014 |
| 2000.6 | 0.015 |
| 2000.7 | 0.014 |
| 2000.8 | 0.01 |
| 2000.9 | 0.004 |
| 2001.0 | 0.001 |
| 2001.1 | 0.002 |
| 2001.2 | 0.004 |
| 2001.3 | 0.006 |
| 2001.4 | 0.009 |
| 2001.5 | 0.002 |
| 2001.6 | 0.002 |
| 2001.7 | 0.005 |
| 2001.8 | 0.009 |
| 2001.9 | 0.013 |
| 2002.0 | 0.008 |
| 2002.1 | 0.004 |
| 2002.2 | 0.004 |
| 2002.3 | 0.006 |
| 2002.4 | 0.009 |
| 2002.5 | 0.009 |
| 2002.6 | 0.001 |
| 2002.7 | 0.009 |
| 2002.8 | 0.01 |
| 2002.9 | 0.015 |
| 2003.0 | 0.013 |
| 2003.1 | 0.01 |
| 2003.2 | 0.002 |
| 2003.3 | 0.005 |
| 2003.4 | 0.003 |
| 2003.5 | 0.005 |
| 2003.6 | 0.001 |
| 2003.7 | 0.009 |
| 2003.8 | 0.005 |
| 2003.9 | 0.009 |
| 2004.0 | 0.009 |
| 2004.1 | 0.011 |
| 2004.2 | 0.014 |
| 2004.3 | 0.013 |
| 2004.4 | 0.011 |
| 2004.5 | 0.01 |
| 2004.6 | 0.016 |
| 2004.7 | 0.023 |
| 2004.8 | 0.023 |
| 2004.9 | 0.025 |
| 2005.0 | 0.033 |
| 2005.1 | 0.033 |
| 2005.2 | 0.026 |
| 2005.3 | 0.026 |
| 2005.4 | 0.03 |
| 2005.5 | 0.025 |
| 2005.6 | 0.022 |
| 2005.7 | 0.026 |
| 2005.8 | 0.023 |
| 2005.9 | 0.009 |
| 2006.0 | 0.008 |
| 2006.1 | 0.01 |
| 2006.2 | 0.004 |
| 2006.3 | 0.005 |
| 2006.4 | 0.013 |
| 2006.5 | 0.015 |
| 2006.6 | 0.015 |
| 2006.7 | 0.017 |
| 2006.8 | 0.019 |
| 2006.9 | 0.019 |
| 2007.0 | 0.02 |
| 2007.1 | 0.018 |
| 2007.2 | 0.014 |
| 2007.3 | 0.018 |
| 2007.4 | 0.021 |
| 2007.5 | 0.017 |
| 2007.6 | 0.014 |
| 2007.7 | 0.023 |
| 2007.8 | 0.016 |
| 2007.9 | 0.012 |
| 2008.0 | 0.013 |
| 2008.1 | 0.021 |
| 2008.2 | 0.021 |
| 2008.3 | 0.024 |
| 2008.4 | 0.026 |
| 2008.5 | 0.026 |
| 2008.6 | 0.022 |
| 2008.7 | 0.02 |
| 2008.8 | 0.016 |
| 2008.9 | 0.019 |
| 2009.0 | 0.02 |
| 2009.1 | 0.023 |
| 2009.2 | 0.022 |
| 2009.3 | 0.025 |
| 2009.4 | 0.017 |
| 2009.5 | 0.016 |
| 2009.6 | 0.016 |
| 2009.7 | 0.014 |
| 2009.8 | 0.018 |
| 2009.9 | 0.024 |
| 2010.0 | 0.024 |
| 2010.1 | 0.019 |
| 2010.2 | 0.015 |
| 2010.3 | 0.011 |
| 2010.4 | 0.005 |
| 2010.5 | 0.01 |
| 2010.6 | 0.009 |
| 2010.7 | 0.019 |
| 2010.8 | 0.02 |
| 2010.9 | 0.025 |
| 2011.0 | 0.017 |
| 2011.1 | 0.021 |
| 2011.2 | 0.019 |
| 2011.3 | 0.023 |
| 2011.4 | 0.023 |
| 2011.5 | 0.027 |
| 2011.6 | 0.025 |
| 2011.7 | 0.027 |
| 2011.8 | 0.024 |
| 2011.9 | 0.028 |
| 2012.0 | 0.025 |
| 2012.1 | 0.029 |
| 2012.2 | 0.023 |
| 2012.3 | 0.028 |
| 2012.4 | 0.022 |
| 2012.5 | 0.027 |
| 2012.6 | 0.025 |
| 2012.7 | 0.024 |
| 2012.8 | 0.02 |
| 2012.9 | 0.022 |
| 2013.0 | 0.015 |
| 2013.1 | 0.017 |
| 2013.2 | 0.023 |
| 2013.3 | 0.024 |
| 2013.4 | 0.024 |
| 2013.5 | 0.033 |
| 2013.6 | 0.035 |
| 2013.7 | 0.035 |
| 2013.8 | 0.038 |
| 2013.9 | 0.036 |
| 2014.0 | 0.029 |
| 2014.1 | 0.029 |
| 2014.2 | 0.032 |
| 2014.3 | 0.031 |
| 2014.4 | 0.037 |
| 2014.5 | 0.039 |
| 2014.6 | 0.037 |
| 2014.7 | 0.037 |
| 2014.8 | 0.038 |
| 2014.9 | 0.038 |
| 2015.0 | 0.043 |
| 2015.1 | 0.044 |
| 2015.2 | 0.04 |
| 2015.3 | 0.043 |
| 2015.4 | 0.046 |
| 2015.5 | 0.048 |
| 2015.6 | 0.049 |
| 2015.7 | 0.06 |
| 2015.8 | 0.063 |
| 2015.9 | 0.066 |
| 2016.0 | 0.073 |
| 2016.1 | 0.07 |
| 2016.2 | 0.066 |
| 2016.3 | 0.065 |
| 2016.4 | 0.066 |
| 2016.5 | 0.062 |
| 2016.6 | 0.075 |
| 2016.7 | 0.074 |
| 2016.8 | 0.078 |
| 2016.9 | 0.078 |
| 2017.0 | 0.074 |
| 2017.1 | 0.068 |
| 2017.2 | 0.076 |
| 2017.3 | 0.07 |
| 2017.4 | 0.067 |
| 2017.5 | 0.073 |
| 2017.6 | 0.073 |
| 2017.7 | 0.062 |
| 2017.8 | 0.064 |
| 2017.9 | 0.059 |
| 2018.0 | 0.054 |
| 2018.1 | 0.045 |
| 2018.2 | 0.052 |
| 2018.3 | 0.049 |
| 2018.4 | 0.055 |
| 2018.5 | 0.052 |
| 2018.6 | 0.062 |
| 2018.7 | 0.059 |
| 2018.8 | 0.059 |
| 2018.9 | 0.057 |
| 2019.0 | 0.051 |
| 2019.1 | 0.043 |
| 2019.2 | 0.037 |
| 2019.3 | 0.036 |
| 2019.4 | 0.04 |
| 2019.5 | 0.036 |
| 2019.6 | 0.038 |
| 2019.7 | 0.041 |
| 2019.8 | 0.043 |
| 2019.9 | 0.038 |
| 2020.0 | 0.046 |
| 2020.1 | 0.042 |
| 2020.2 | 0.039 |
| 2020.3 | 0.038 |
| 2020.4 | 0.033 |
| 2020.5 | 0.035 |
| 2020.6 | 0.038 |
| 2020.7 | 0.037 |
| 2020.8 | 0.03 |
| 2020.9 | 0.041 |
| 2021.0 | 0.034 |
| 2021.1 | 0.036 |
| 2021.2 | 0.038 |
| 2021.3 | 0.041 |
| 2021.4 | 0.037 |
| 2021.5 | 0.04 |
| 2021.6 | 0.037 |
| 2021.7 | 0.035 |
| 2021.8 | 0.041 |
| 2021.9 | 0.036 |
| 2022.0 | 0.04 |
| 2022.1 | 0.038 |
| 2022.2 | 0.023 |
| 2022.3 | 0.016 |
| 2022.4 | 0.016 |
| 2022.5 | 0.015 |
| 2022.6 | 0.015 |
| 2022.7 | 0.027 |
| 2022.8 | 0.023 |
| 2022.9 | 0.018 |
| 2023.0 | 0.018 |
| 2023.1 | 0.021 |
| 2023.2 | 0.021 |
| 2023.3 | 0.03 |
| 2023.4 | 0.029 |
| 2023.5 | 0.031 |
| 2023.6 | 0.032 |
| 2023.7 | 0.035 |
| 2023.8 | 0.027 |
| 2023.9 | 0.034 |
| 2024.0 | 0.023 |
| 2024.1 | 0.021 |
| 2024.2 | 0.021 |
| 2024.3 | 0.022 |
| 2024.4 | 0.022 |
| 2024.5 | 0.027 |
| 2024.6 | 0.026 |
| 2024.7 | 0.023 |
| 2024.8 | 0.022 |
| 2024.9 | 0.018 |
| 2025.0 | 0.021 |
| 2025.1 | 0.02 |
| 2025.2 | 0.025 |
| 2025.3 | 0.031 |
| 2025.4 | 0.039 |
| 2025.5 | 0.042 |
| 2025.6 | 0.046 |
| 2025.7 | 0.045 |
| 2025.8 | 0.035 |
| 2025.9 | 0.027 |
| 2026.0 | 0.019 |
| 2026.1 | 0.021 |
| 2026.2 | 0.022 |
| 2026.3 | 0.033 |
| 2026.4 | 0.039 |
| 2026.5 | 0.043 |
| 2026.6 | 0.034 |
| 2026.7 | 0.03 |
| 2026.8 | 0.03 |
| 2026.9 | 0.025 |
| 2027.0 | 0.028 |
| 2027.1 | 0.032 |
| 2027.2 | 0.037 |
| 2027.3 | 0.031 |
| 2027.4 | 0.032 |
| 2027.5 | 0.026 |
| 2027.6 | 0.025 |
| 2027.7 | 0.021 |
| 2027.8 | 0.021 |
| 2027.9 | 0.021 |
| 2028.0 | 0.028 |
| 2028.1 | 0.036 |
| 2028.2 | 0.033 |
| 2028.3 | 0.04 |
| 2028.4 | 0.043 |
| 2028.5 | 0.039 |
| 2028.6 | 0.039 |
| 2028.7 | 0.038 |
| 2028.8 | 0.028 |
| 2028.9 | 0.021 |
| 2029.0 | 0.022 |
| 2029.1 | 0.018 |
| 2029.2 | 0.017 |
| 2029.3 | 0.026 |
| 2029.4 | 0.022 |
| 2029.5 | 0.018 |
| 2029.6 | 0.028 |
| 2029.7 | 0.036 |
| 2029.8 | 0.026 |
| 2029.9 | 0.037 |
| 2030.0 | 0.04 |
| 2030.1 | 0.028 |
| 2030.2 | 0.02 |
| 2030.3 | 0.026 |
| 2030.4 | 0.022 |
| 2030.5 | 0.021 |
| 2030.6 | 0.021 |
| 2030.7 | 0.025 |
| 2030.8 | 0.025 |
| 2030.9 | 0.027 |
| 2031.0 | 0.031 |
| 2031.1 | 0.03 |
| 2031.2 | 0.027 |
| 2031.3 | 0.022 |
| 2031.4 | 0.015 |
| 2031.5 | 0.005 |
| 2031.6 | 0.01 |
| 2031.7 | 0.01 |
| 2031.8 | 0.019 |
| 2031.9 | 0.021 |
| 2032.0 | 0.028 |
| 2032.1 | 0.025 |
| 2032.2 | 0.015 |
| 2032.3 | 0.012 |
| 2032.4 | 0.019 |
| 2032.5 | 0.021 |
| 2032.6 | 0.02 |
| 2032.7 | 0.037 |
| 2032.8 | 0.036 |
| 2032.9 | 0.028 |
| 2033.0 | 0.022 |
| 2033.1 | 0.02 |
| 2033.2 | 0.017 |
| 2033.3 | 0.012 |
| 2033.4 | 0.016 |
| 2033.5 | 0.023 |
| 2033.6 | 0.028 |
| 2033.7 | 0.026 |
| 2033.8 | 0.032 |
| 2033.9 | 0.034 |
| 2034.0 | 0.026 |
| 2034.1 | 0.028 |
| 2034.2 | 0.027 |
| 2034.3 | 0.027 |
| 2034.4 | 0.027 |
| 2034.5 | 0.036 |
| 2034.6 | 0.036 |
| 2034.7 | 0.04 |
| 2034.8 | 0.042 |
| 2034.9 | 0.036 |
| 2035.0 | 0.039 |
| 2035.1 | 0.035 |
| 2035.2 | 0.034 |
| 2035.3 | 0.032 |
| 2035.4 | 0.041 |
| 2035.5 | 0.03 |
| 2035.6 | 0.032 |
| 2035.7 | 0.031 |
| 2035.8 | 0.035 |
| 2035.9 | 0.033 |
| 2036.0 | 0.037 |
| 2036.1 | 0.039 |
| 2036.2 | 0.038 |
| 2036.3 | 0.033 |
| 2036.4 | 0.029 |
| 2036.5 | 0.034 |
| 2036.6 | 0.029 |
| 2036.7 | 0.03 |
| 2036.8 | 0.029 |
| 2036.9 | 0.032 |
| 2037.0 | 0.035 |
| 2037.1 | 0.042 |
| 2037.2 | 0.042 |
| 2037.3 | 0.044 |
| 2037.4 | 0.043 |
| 2037.5 | 0.041 |
| 2037.6 | 0.038 |
| 2037.7 | 0.04 |
| 2037.8 | 0.043 |
| 2037.9 | 0.045 |
| 2038.0 | 0.041 |
| 2038.1 | 0.043 |
| 2038.2 | 0.046 |
| 2038.3 | 0.048 |
| 2038.4 | 0.04 |
| 2038.5 | 0.036 |
| 2038.6 | 0.024 |
| 2038.7 | 0.021 |
| 2038.8 | 0.015 |
| 2038.9 | 0.022 |
| 2039.0 | 0.037 |
| 2039.1 | 0.046 |
| 2039.2 | 0.049 |
| 2039.3 | 0.05 |
| 2039.4 | 0.052 |
| 2039.5 | 0.045 |
| 2039.6 | 0.046 |
| 2039.7 | 0.046 |
| 2039.8 | 0.05 |
| 2039.9 | 0.051 |
| 2040.0 | 0.047 |
| 2040.1 | 0.041 |
| 2040.2 | 0.042 |
| 2040.3 | 0.041 |
| 2040.4 | 0.04 |
| 2040.5 | 0.035 |
| 2040.6 | 0.035 |
| 2040.7 | 0.032 |
| 2040.8 | 0.027 |
| 2040.9 | 0.024 |
| 2041.0 | 0.033 |
| 2041.1 | 0.038 |
| 2041.2 | 0.035 |
| 2041.3 | 0.036 |
| 2041.4 | 0.04 |
| 2041.5 | 0.034 |
| 2041.6 | 0.031 |
| 2041.7 | 0.037 |
| 2041.8 | 0.04 |
| 2041.9 | 0.031 |
| 2042.0 | 0.035 |
| 2042.1 | 0.037 |
| 2042.2 | 0.034 |
| 2042.3 | 0.03 |
| 2042.4 | 0.036 |
| 2042.5 | 0.035 |
| 2042.6 | 0.033 |
| 2042.7 | 0.03 |
| 2042.8 | 0.031 |
| 2042.9 | 0.037 |
| 2043.0 | 0.039 |
| 2043.1 | 0.04 |
| 2043.2 | 0.045 |
| 2043.3 | 0.048 |
| 2043.4 | 0.04 |
| 2043.5 | 0.036 |
| 2043.6 | 0.038 |
| 2043.7 | 0.035 |
| 2043.8 | 0.028 |
| 2043.9 | 0.021 |
| 2044.0 | 0.024 |
| 2044.1 | 0.023 |
| 2044.2 | 0.018 |
| 2044.3 | 0.032 |
| 2044.4 | 0.042 |
| 2044.5 | 0.04 |
| 2044.6 | 0.046 |
| 2044.7 | 0.048 |
| 2044.8 | 0.037 |
| 2044.9 | 0.038 |
| 2045.0 | 0.041 |
| 2045.1 | 0.035 |
| 2045.2 | 0.033 |
| 2045.3 | 0.036 |
| 2045.4 | 0.037 |
| 2045.5 | 0.037 |
| 2045.6 | 0.04 |
| 2045.7 | 0.043 |
| 2045.8 | 0.047 |
| 2045.9 | 0.038 |
| 2046.0 | 0.033 |
| 2046.1 | 0.025 |
| 2046.2 | 0.022 |
| 2046.3 | 0.012 |
| 2046.4 | 0.01 |
| 2046.5 | 0.011 |
| 2046.6 | 0.018 |
| 2046.7 | 0.023 |
| 2046.8 | 0.027 |
| 2046.9 | 0.031 |
| 2047.0 | 0.036 |
| 2047.1 | 0.038 |
| 2047.2 | 0.031 |
| 2047.3 | 0.031 |
| 2047.4 | 0.025 |
| 2047.5 | 0.02 |
| 2047.6 | 0.01 |
| 2047.7 | 0.021 |
| 2047.8 | 0.018 |
| 2047.9 | 0.027 |
| 2048.0 | 0.028 |
| 2048.1 | 0.031 |
| 2048.2 | 0.027 |
| 2048.3 | 0.03 |
| 2048.4 | 0.033 |
| 2048.5 | 0.03 |
| 2048.6 | 0.035 |
| 2048.7 | 0.031 |
| 2048.8 | 0.03 |
| 2048.9 | 0.021 |
| 2049.0 | 0.023 |
| 2049.1 | 0.02 |
| 2049.2 | 0.023 |
| 2049.3 | 0.021 |
| 2049.4 | 0.029 |
| 2049.5 | 0.032 |
| 2049.6 | 0.032 |
| 2049.7 | 0.034 |
| 2049.8 | 0.041 |
| 2049.9 | 0.044 |
| 2050.0 | 0.045 |
| 2050.1 | 0.047 |
| 2050.2 | 0.048 |
| 2050.3 | 0.047 |
| 2050.4 | 0.043 |
| 2050.5 | 0.041 |
| 2050.6 | 0.038 |
| 2050.7 | 0.034 |
| 2050.8 | 0.035 |
| 2050.9 | 0.032 |
| 2051.0 | 0.031 |
| 2051.1 | 0.029 |
| 2051.2 | 0.035 |
| 2051.3 | 0.024 |
| 2051.4 | 0.021 |
| 2051.5 | 0.02 |
| 2051.6 | 0.025 |
| 2051.7 | 0.02 |
| 2051.8 | 0.025 |
| 2051.9 | 0.025 |
| 2052.0 | 0.034 |
| 2052.1 | 0.034 |
| 2052.2 | 0.03 |
| 2052.3 | 0.033 |
| 2052.4 | 0.044 |
| 2052.5 | 0.035 |
| 2052.6 | 0.029 |
| 2052.7 | 0.028 |
| 2052.8 | 0.027 |
| 2052.9 | 0.021 |
| 2053.0 | 0.025 |
| 2053.1 | 0.029 |
| 2053.2 | 0.031 |
| 2053.3 | 0.03 |
| 2053.4 | 0.038 |
| 2053.5 | 0.033 |
| 2053.6 | 0.031 |
| 2053.7 | 0.031 |
| 2053.8 | 0.032 |
| 2053.9 | 0.026 |
| 2054.0 | 0.034 |
| 2054.1 | 0.032 |
| 2054.2 | 0.025 |
| 2054.3 | 0.023 |
| 2054.4 | 0.017 |
| 2054.5 | 0.019 |
| 2054.6 | 0.025 |
| 2054.7 | 0.028 |
| 2054.8 | 0.036 |
| 2054.9 | 0.03 |
| 2055.0 | 0.029 |
| 2055.1 | 0.026 |
| 2055.2 | 0.031 |
| 2055.3 | 0.025 |
| 2055.4 | 0.028 |
| 2055.5 | 0.019 |
| 2055.6 | 0.013 |
| 2055.7 | 0.018 |
| 2055.8 | 0.018 |
| 2055.9 | 0.023 |
| 2056.0 | 0.023 |
| 2056.1 | 0.028 |
| 2056.2 | 0.021 |
| 2056.3 | 0.015 |
| 2056.4 | 0.014 |
| 2056.5 | 0.019 |
| 2056.6 | 0.02 |
| 2056.7 | 0.021 |
| 2056.8 | 0.024 |
| 2056.9 | 0.027 |
| 2057.0 | 0.028 |
| 2057.1 | 0.02 |
| 2057.2 | 0.023 |
| 2057.3 | 0.022 |
| 2057.4 | 0.021 |
| 2057.5 | 0.017 |
| 2057.6 | 0.022 |
| 2057.7 | 0.018 |
| 2057.8 | 0.017 |
| 2057.9 | 0.018 |
| 2058.0 | 0.021 |
| 2058.1 | 0.028 |
| 2058.2 | 0.027 |
| 2058.3 | 0.027 |
| 2058.4 | 0.023 |
| 2058.5 | 0.021 |
| 2058.6 | 0.016 |
| 2058.7 | 0.019 |
| 2058.8 | 0.022 |
| 2058.9 | 0.021 |
| 2059.0 | 0.025 |
| 2059.1 | 0.024 |
| 2059.2 | 0.034 |
| 2059.3 | 0.028 |
| 2059.4 | 0.035 |
| 2059.5 | 0.035 |
| 2059.6 | 0.031 |
| 2059.7 | 0.026 |
| 2059.8 | 0.036 |
| 2059.9 | 0.031 |
| 2060.0 | 0.031 |
| 2060.1 | 0.038 |
| 2060.2 | 0.033 |
| 2060.3 | 0.032 |
| 2060.4 | 0.039 |
| 2060.5 | 0.042 |
| 2060.6 | 0.041 |
| 2060.7 | 0.049 |
| 2060.8 | 0.044 |
| 2060.9 | 0.036 |
| 2061.0 | 0.033 |
| 2061.1 | 0.025 |
| 2061.2 | 0.016 |
| 2061.3 | 0.018 |
| 2061.4 | 0.02 |
| 2061.5 | 0.015 |
| 2061.6 | 0.017 |
| 2061.7 | 0.019 |
| 2061.8 | 0.017 |
| 2061.9 | 0.024 |
| 2062.0 | 0.033 |
| 2062.1 | 0.036 |
| 2062.2 | 0.039 |
| 2062.3 | 0.039 |
| 2062.4 | 0.038 |
| 2062.5 | 0.032 |
| 2062.6 | 0.038 |
| 2062.7 | 0.034 |
| 2062.8 | 0.037 |
| 2062.9 | 0.028 |
| 2063.0 | 0.028 |
| 2063.1 | 0.023 |
| 2063.2 | 0.032 |
| 2063.3 | 0.038 |
| 2063.4 | 0.041 |
| 2063.5 | 0.041 |
| 2063.6 | 0.041 |
| 2063.7 | 0.026 |
| 2063.8 | 0.022 |
| 2063.9 | 0.02 |
| 2064.0 | 0.024 |
| 2064.1 | 0.03 |
| 2064.2 | 0.037 |
| 2064.3 | 0.047 |
| 2064.4 | 0.051 |
| 2064.5 | 0.052 |
| 2064.6 | 0.049 |
| 2064.7 | 0.05 |
| 2064.8 | 0.036 |
| 2064.9 | 0.039 |
| 2065.0 | 0.039 |
| 2065.1 | 0.037 |
| 2065.2 | 0.038 |
| 2065.3 | 0.047 |
| 2065.4 | 0.041 |
| 2065.5 | 0.043 |
| 2065.6 | 0.045 |
| 2065.7 | 0.046 |
| 2065.8 | 0.046 |
| 2065.9 | 0.059 |
| 2066.0 | 0.059 |
| 2066.1 | 0.061 |
| 2066.2 | 0.055 |
| 2066.3 | 0.058 |
| 2066.4 | 0.052 |
| 2066.5 | 0.05 |
| 2066.6 | 0.054 |
| 2066.7 | 0.052 |
| 2066.8 | 0.048 |
| 2066.9 | 0.041 |
| 2067.0 | 0.045 |
| 2067.1 | 0.042 |
| 2067.2 | 0.048 |
| 2067.3 | 0.053 |
| 2067.4 | 0.052 |
| 2067.5 | 0.057 |
| 2067.6 | 0.049 |
| 2067.7 | 0.05 |
| 2067.8 | 0.037 |
| 2067.9 | 0.039 |
| 2068.0 | 0.034 |
| 2068.1 | 0.046 |
| 2068.2 | 0.049 |
| 2068.3 | 0.056 |
| 2068.4 | 0.061 |
| 2068.5 | 0.068 |
| 2068.6 | 0.069 |
| 2068.7 | 0.073 |
| 2068.8 | 0.068 |
| 2068.9 | 0.065 |
| 2069.0 | 0.048 |
| 2069.1 | 0.04 |
| 2069.2 | 0.036 |
| 2069.3 | 0.037 |
| 2069.4 | 0.043 |
| 2069.5 | 0.053 |
| 2069.6 | 0.058 |
| 2069.7 | 0.056 |
| 2069.8 | 0.071 |
| 2069.9 | 0.067 |
| 2070.0 | 0.058 |
| 2070.1 | 0.057 |
| 2070.2 | 0.062 |
| 2070.3 | 0.05 |
| 2070.4 | 0.051 |
| 2070.5 | 0.054 |
| 2070.6 | 0.054 |
| 2070.7 | 0.048 |
| 2070.8 | 0.052 |
| 2070.9 | 0.048 |
| 2071.0 | 0.052 |
| 2071.1 | 0.042 |
| 2071.2 | 0.043 |
| 2071.3 | 0.04 |
| 2071.4 | 0.046 |
| 2071.5 | 0.039 |
| 2071.6 | 0.047 |
| 2071.7 | 0.039 |
| 2071.8 | 0.035 |
| 2071.9 | 0.04 |
| 2072.0 | 0.037 |
| 2072.1 | 0.041 |
| 2072.2 | 0.045 |
| 2072.3 | 0.044 |
| 2072.4 | 0.04 |
| 2072.5 | 0.053 |
| 2072.6 | 0.046 |
| 2072.7 | 0.049 |
| 2072.8 | 0.054 |
| 2072.9 | 0.049 |
| 2073.0 | 0.045 |
| 2073.1 | 0.048 |
| 2073.2 | 0.048 |
| 2073.3 | 0.046 |
| 2073.4 | 0.044 |
| 2073.5 | 0.04 |
| 2073.6 | 0.044 |
| 2073.7 | 0.042 |
| 2073.8 | 0.047 |
| 2073.9 | 0.041 |
| 2074.0 | 0.045 |
| 2074.1 | 0.042 |
| 2074.2 | 0.044 |
| 2074.3 | 0.041 |
| 2074.4 | 0.054 |
| 2074.5 | 0.051 |
| 2074.6 | 0.057 |
| 2074.7 | 0.053 |
| 2074.8 | 0.059 |
| 2074.9 | 0.064 |
| 2075.0 | 0.07 |
| 2075.1 | 0.065 |
| 2075.2 | 0.064 |
| 2075.3 | 0.063 |
| 2075.4 | 0.055 |
| 2075.5 | 0.049 |
| 2075.6 | 0.047 |
| 2075.7 | 0.051 |
| 2075.8 | 0.043 |
| 2075.9 | 0.042 |
| 2076.0 | 0.047 |
| 2076.1 | 0.049 |
| 2076.2 | 0.054 |
| 2076.3 | 0.057 |
| 2076.4 | 0.066 |
| 2076.5 | 0.06 |
| 2076.6 | 0.055 |
| 2076.7 | 0.06 |
| 2076.8 | 0.06 |
| 2076.9 | 0.063 |
| 2077.0 | 0.066 |
| 2077.1 | 0.075 |
| 2077.2 | 0.071 |
| 2077.3 | 0.08 |
| 2077.4 | 0.079 |
| 2077.5 | 0.084 |
| 2077.6 | 0.082 |
| 2077.7 | 0.085 |
| 2077.8 | 0.086 |
| 2077.9 | 0.081 |
| 2078.0 | 0.082 |
| 2078.1 | 0.083 |
| 2078.2 | 0.082 |
| 2078.3 | 0.072 |
| 2078.4 | 0.08 |
| 2078.5 | 0.071 |
| 2078.6 | 0.069 |
| 2078.7 | 0.062 |
| 2078.8 | 0.064 |
| 2078.9 | 0.061 |
| 2079.0 | 0.061 |
| 2079.1 | 0.064 |
| 2079.2 | 0.067 |
| 2079.3 | 0.062 |
| 2079.4 | 0.058 |
| 2079.5 | 0.066 |
| 2079.6 | 0.066 |
| 2079.7 | 0.064 |
| 2079.8 | 0.071 |
| 2079.9 | 0.08 |
| 2080.0 | 0.08 |
| 2080.1 | 0.083 |
| 2080.2 | 0.083 |
| 2080.3 | 0.086 |
| 2080.4 | 0.081 |
| 2080.5 | 0.083 |
| 2080.6 | 0.084 |
| 2080.7 | 0.08 |
| 2080.8 | 0.076 |
| 2080.9 | 0.074 |
| 2081.0 | 0.069 |
| 2081.1 | 0.063 |
| 2081.2 | 0.065 |
| 2081.3 | 0.063 |
| 2081.4 | 0.066 |
| 2081.5 | 0.062 |
| 2081.6 | 0.067 |
| 2081.7 | 0.075 |
| 2081.8 | 0.084 |
| 2081.9 | 0.079 |
| 2082.0 | 0.086 |
| 2082.1 | 0.087 |
| 2082.2 | 0.085 |
| 2082.3 | 0.08 |
| 2082.4 | 0.07 |
| 2082.5 | 0.058 |
| 2082.6 | 0.054 |
| 2082.7 | 0.049 |
| 2082.8 | 0.046 |
| 2082.9 | 0.05 |
| 2083.0 | 0.056 |
| 2083.1 | 0.058 |
| 2083.2 | 0.049 |
| 2083.3 | 0.051 |
| 2083.4 | 0.058 |
| 2083.5 | 0.064 |
| 2083.6 | 0.06 |
| 2083.7 | 0.057 |
| 2083.8 | 0.059 |
| 2083.9 | 0.058 |
| 2084.0 | 0.049 |
| 2084.1 | 0.047 |
| 2084.2 | 0.054 |
| 2084.3 | 0.05 |
| 2084.4 | 0.051 |
| 2084.5 | 0.056 |
| 2084.6 | 0.059 |
| 2084.7 | 0.061 |
| 2084.8 | 0.061 |
| 2084.9 | 0.062 |
| 2085.0 | 0.065 |
| 2085.1 | 0.063 |
| 2085.2 | 0.061 |
| 2085.3 | 0.064 |
| 2085.4 | 0.064 |
| 2085.5 | 0.062 |
| 2085.6 | 0.065 |
| 2085.7 | 0.077 |
| 2085.8 | 0.079 |
| 2085.9 | 0.076 |
| 2086.0 | 0.073 |
| 2086.1 | 0.076 |
| 2086.2 | 0.069 |
| 2086.3 | 0.067 |
| 2086.4 | 0.067 |
| 2086.5 | 0.065 |
| 2086.6 | 0.06 |
| 2086.7 | 0.069 |
| 2086.8 | 0.06 |
| 2086.9 | 0.058 |
| 2087.0 | 0.061 |
| 2087.1 | 0.058 |
| 2087.2 | 0.055 |
| 2087.3 | 0.06 |
| 2087.4 | 0.062 |
| 2087.5 | 0.065 |
| 2087.6 | 0.065 |
| 2087.7 | 0.063 |
| 2087.8 | 0.073 |
| 2087.9 | 0.072 |
| 2088.0 | 0.075 |
| 2088.1 | 0.082 |
| 2088.2 | 0.078 |
| 2088.3 | 0.072 |
| 2088.4 | 0.069 |
| 2088.5 | 0.067 |
| 2088.6 | 0.068 |
| 2088.7 | 0.076 |
| 2088.8 | 0.086 |
| 2088.9 | 0.094 |
| 2089.0 | 0.094 |
| 2089.1 | 0.097 |
| 2089.2 | 0.103 |
| 2089.3 | 0.101 |
| 2089.4 | 0.103 |
| 2089.5 | 0.103 |
| 2089.6 | 0.101 |
| 2089.7 | 0.101 |
| 2089.8 | 0.097 |
| 2089.9 | 0.094 |
| 2090.0 | 0.096 |
| 2090.1 | 0.093 |
| 2090.2 | 0.093 |
| 2090.3 | 0.103 |
| 2090.4 | 0.104 |
| 2090.5 | 0.105 |
| 2090.6 | 0.118 |
| 2090.7 | 0.117 |
| 2090.8 | 0.113 |
| 2090.9 | 0.109 |
| 2091.0 | 0.103 |
| 2091.1 | 0.097 |
| 2091.2 | 0.097 |
| 2091.3 | 0.106 |
| 2091.4 | 0.115 |
| 2091.5 | 0.123 |
| 2091.6 | 0.113 |
| 2091.7 | 0.109 |
| 2091.8 | 0.099 |
| 2091.9 | 0.107 |
| 2092.0 | 0.106 |
| 2092.1 | 0.111 |
| 2092.2 | 0.12 |
| 2092.3 | 0.117 |
| 2092.4 | 0.105 |
| 2092.5 | 0.097 |
| 2092.6 | 0.096 |
| 2092.7 | 0.083 |
| 2092.8 | 0.078 |
| 2092.9 | 0.072 |
| 2093.0 | 0.077 |
| 2093.1 | 0.079 |
| 2093.2 | 0.079 |
| 2093.3 | 0.089 |
| 2093.4 | 0.103 |
| 2093.5 | 0.103 |
| 2093.6 | 0.096 |
| 2093.7 | 0.094 |
| 2093.8 | 0.095 |
| 2093.9 | 0.079 |
| 2094.0 | 0.074 |
| 2094.1 | 0.075 |
| 2094.2 | 0.081 |
| 2094.3 | 0.064 |
| 2094.4 | 0.07 |
| 2094.5 | 0.066 |
| 2094.6 | 0.07 |
| 2094.7 | 0.068 |
| 2094.8 | 0.08 |
| 2094.9 | 0.079 |
| 2095.0 | 0.085 |
| 2095.1 | 0.084 |
| 2095.2 | 0.086 |
| 2095.3 | 0.082 |
| 2095.4 | 0.082 |
| 2095.5 | 0.082 |
| 2095.6 | 0.08 |
| 2095.7 | 0.07 |
| 2095.8 | 0.068 |
| 2095.9 | 0.074 |
| 2096.0 | 0.067 |
| 2096.1 | 0.076 |
| 2096.2 | 0.083 |
| 2096.3 | 0.08 |
| 2096.4 | 0.075 |
| 2096.5 | 0.082 |
| 2096.6 | 0.067 |
| 2096.7 | 0.067 |
| 2096.8 | 0.074 |
| 2096.9 | 0.078 |
| 2097.0 | 0.077 |
| 2097.1 | 0.093 |
| 2097.2 | 0.087 |
| 2097.3 | 0.085 |
| 2097.4 | 0.078 |
| 2097.5 | 0.078 |
| 2097.6 | 0.078 |
| 2097.7 | 0.086 |
| 2097.8 | 0.091 |
| 2097.9 | 0.111 |
| 2098.0 | 0.11 |
| 2098.1 | 0.104 |
| 2098.2 | 0.097 |
| 2098.3 | 0.1 |
| 2098.4 | 0.085 |
| 2098.5 | 0.084 |
| 2098.6 | 0.085 |
| 2098.7 | 0.086 |
| 2098.8 | 0.081 |
| 2098.9 | 0.081 |
| 2099.0 | 0.087 |
| 2099.1 | 0.084 |
| 2099.2 | 0.085 |
| 2099.3 | 0.087 |
| 2099.4 | 0.084 |
| 2099.5 | 0.086 |
| 2099.6 | 0.089 |
| 2099.7 | 0.08 |
| 2099.8 | 0.072 |
| 2099.9 | 0.071 |
| 2100.0 | 0.06 |
| 2100.1 | 0.053 |
| 2100.2 | 0.053 |
| 2100.3 | 0.053 |
| 2100.4 | 0.056 |
| 2100.5 | 0.048 |
| 2100.6 | 0.05 |
| 2100.7 | 0.051 |
| 2100.8 | 0.053 |
| 2100.9 | 0.048 |
| 2101.0 | 0.052 |
| 2101.1 | 0.042 |
| 2101.2 | 0.043 |
| 2101.3 | 0.044 |
| 2101.4 | 0.04 |
| 2101.5 | 0.045 |
| 2101.6 | 0.054 |
| 2101.7 | 0.059 |
| 2101.8 | 0.052 |
| 2101.9 | 0.049 |
| 2102.0 | 0.047 |
| 2102.1 | 0.046 |
| 2102.2 | 0.044 |
| 2102.3 | 0.053 |
| 2102.4 | 0.055 |
| 2102.5 | 0.055 |
| 2102.6 | 0.043 |
| 2102.7 | 0.045 |
| 2102.8 | 0.039 |
| 2102.9 | 0.043 |
| 2103.0 | 0.045 |
| 2103.1 | 0.053 |
| 2103.2 | 0.05 |
| 2103.3 | 0.05 |
| 2103.4 | 0.041 |
| 2103.5 | 0.046 |
| 2103.6 | 0.053 |
| 2103.7 | 0.054 |
| 2103.8 | 0.054 |
| 2103.9 | 0.063 |
| 2104.0 | 0.056 |
| 2104.1 | 0.049 |
| 2104.2 | 0.047 |
| 2104.3 | 0.044 |
| 2104.4 | 0.044 |
| 2104.5 | 0.043 |
| 2104.6 | 0.037 |
| 2104.7 | 0.043 |
| 2104.8 | 0.047 |
| 2104.9 | 0.041 |
| 2105.0 | 0.038 |
| 2105.1 | 0.047 |
| 2105.2 | 0.041 |
| 2105.3 | 0.038 |
| 2105.4 | 0.043 |
| 2105.5 | 0.043 |
| 2105.6 | 0.043 |
| 2105.7 | 0.044 |
| 2105.8 | 0.048 |
| 2105.9 | 0.037 |
| 2106.0 | 0.046 |
| 2106.1 | 0.043 |
| 2106.2 | 0.046 |
| 2106.3 | 0.045 |
| 2106.4 | 0.065 |
| 2106.5 | 0.062 |
| 2106.6 | 0.066 |
| 2106.7 | 0.061 |
| 2106.8 | 0.063 |
| 2106.9 | 0.042 |
| 2107.0 | 0.04 |
| 2107.1 | 0.035 |
| 2107.2 | 0.041 |
| 2107.3 | 0.039 |
| 2107.4 | 0.053 |
| 2107.5 | 0.048 |
| 2107.6 | 0.043 |
| 2107.7 | 0.047 |
| 2107.8 | 0.047 |
| 2107.9 | 0.034 |
| 2108.0 | 0.043 |
| 2108.1 | 0.05 |
| 2108.2 | 0.038 |
| 2108.3 | 0.041 |
| 2108.4 | 0.046 |
| 2108.5 | 0.043 |
| 2108.6 | 0.037 |
| 2108.7 | 0.04 |
| 2108.8 | 0.039 |
| 2108.9 | 0.032 |
| 2109.0 | 0.028 |
| 2109.1 | 0.022 |
| 2109.2 | 0.019 |
| 2109.3 | 0.027 |
| 2109.4 | 0.036 |
| 2109.5 | 0.037 |
| 2109.6 | 0.047 |
| 2109.7 | 0.044 |
| 2109.8 | 0.032 |
| 2109.9 | 0.03 |
| 2110.0 | 0.03 |
| 2110.1 | 0.03 |
| 2110.2 | 0.036 |
| 2110.3 | 0.037 |
| 2110.4 | 0.041 |
| 2110.5 | 0.032 |
| 2110.6 | 0.029 |
| 2110.7 | 0.03 |
| 2110.8 | 0.021 |
| 2110.9 | 0.021 |
| 2111.0 | 0.029 |
| 2111.1 | 0.031 |
| 2111.2 | 0.025 |
| 2111.3 | 0.026 |
| 2111.4 | 0.025 |
| 2111.5 | 0.016 |
| 2111.6 | 0.015 |
| 2111.7 | 0.017 |
| 2111.8 | 0.016 |
| 2111.9 | 0.007 |
| 2112.0 | 0.018 |
| 2112.1 | 0.015 |
| 2112.2 | 0.017 |
| 2112.3 | 0.02 |
| 2112.4 | 0.037 |
| 2112.5 | 0.038 |
| 2112.6 | 0.039 |
| 2112.7 | 0.041 |
| 2112.8 | 0.05 |
| 2112.9 | 0.04 |
| 2113.0 | 0.023 |
| 2113.1 | 0.028 |
| 2113.2 | 0.022 |
| 2113.3 | 0.016 |
| 2113.4 | 0.015 |
| 2113.5 | 0.022 |
| 2113.6 | 0.019 |
| 2113.7 | 0.015 |
| 2113.8 | 0.017 |
| 2113.9 | 0.02 |
| 2114.0 | 0.019 |
| 2114.1 | 0.025 |
| 2114.2 | 0.032 |
| 2114.3 | 0.034 |
| 2114.4 | 0.025 |
| 2114.5 | 0.032 |
| 2114.6 | 0.028 |
| 2114.7 | 0.026 |
| 2114.8 | 0.024 |
| 2114.9 | 0.032 |
| 2115.0 | 0.028 |
| 2115.1 | 0.025 |
| 2115.2 | 0.026 |
| 2115.3 | 0.018 |
| 2115.4 | 0.023 |
| 2115.5 | 0.021 |
| 2115.6 | 0.02 |
| 2115.7 | 0.023 |
| 2115.8 | 0.026 |
| 2115.9 | 0.027 |
| 2116.0 | 0.035 |
| 2116.1 | 0.034 |
| 2116.2 | 0.029 |
| 2116.3 | 0.032 |
| 2116.4 | 0.033 |
| 2116.5 | 0.039 |
| 2116.6 | 0.03 |
| 2116.7 | 0.025 |
| 2116.8 | 0.015 |
| 2116.9 | 0.02 |
| 2117.0 | 0.003 |
| 2117.1 | 0.009 |
| 2117.2 | 0.018 |
| 2117.3 | 0.022 |
| 2117.4 | 0.018 |
| 2117.5 | 0.028 |
| 2117.6 | 0.03 |
| 2117.7 | 0.027 |
| 2117.8 | 0.037 |
| 2117.9 | 0.027 |
| 2118.0 | 0.021 |
| 2118.1 | 0.03 |
| 2118.2 | 0.029 |
| 2118.3 | 0.03 |
| 2118.4 | 0.028 |
| 2118.5 | 0.036 |
| 2118.6 | 0.029 |
| 2118.7 | 0.035 |
| 2118.8 | 0.035 |
| 2118.9 | 0.048 |
| 2119.0 | 0.04 |
| 2119.1 | 0.041 |
| 2119.2 | 0.04 |
| 2119.3 | 0.039 |
| 2119.4 | 0.026 |
| 2119.5 | 0.029 |
| 2119.6 | 0.038 |
| 2119.7 | 0.041 |
| 2119.8 | 0.039 |
| 2119.9 | 0.049 |
| 2120.0 | 0.054 |
| 2120.1 | 0.042 |
| 2120.2 | 0.038 |
| 2120.3 | 0.036 |
| 2120.4 | 0.033 |
| 2120.5 | 0.026 |
| 2120.6 | 0.033 |
| 2120.7 | 0.035 |
| 2120.8 | 0.044 |
| 2120.9 | 0.049 |
| 2121.0 | 0.056 |
| 2121.1 | 0.047 |
| 2121.2 | 0.043 |
| 2121.3 | 0.043 |
| 2121.4 | 0.035 |
| 2121.5 | 0.034 |
| 2121.6 | 0.039 |
| 2121.7 | 0.035 |
| 2121.8 | 0.027 |
| 2121.9 | 0.023 |
| 2122.0 | 0.024 |
| 2122.1 | 0.019 |
| 2122.2 | 0.023 |
| 2122.3 | 0.024 |
| 2122.4 | 0.038 |
| 2122.5 | 0.048 |
| 2122.6 | 0.056 |
| 2122.7 | 0.058 |
| 2122.8 | 0.055 |
| 2122.9 | 0.05 |
| 2123.0 | 0.046 |
| 2123.1 | 0.046 |
| 2123.2 | 0.039 |
| 2123.3 | 0.043 |
| 2123.4 | 0.047 |
| 2123.5 | 0.047 |
| 2123.6 | 0.043 |
| 2123.7 | 0.048 |
| 2123.8 | 0.051 |
| 2123.9 | 0.046 |
| 2124.0 | 0.04 |
| 2124.1 | 0.044 |
| 2124.2 | 0.036 |
| 2124.3 | 0.043 |
| 2124.4 | 0.043 |
| 2124.5 | 0.052 |
| 2124.6 | 0.051 |
| 2124.7 | 0.062 |
| 2124.8 | 0.059 |
| 2124.9 | 0.061 |
| 2125.0 | 0.04 |
| 2125.1 | 0.036 |
| 2125.2 | 0.04 |
| 2125.3 | 0.034 |
| 2125.4 | 0.026 |
| 2125.5 | 0.047 |
| 2125.6 | 0.051 |
| 2125.7 | 0.046 |
| 2125.8 | 0.055 |
| 2125.9 | 0.061 |
| 2126.0 | 0.053 |
| 2126.1 | 0.048 |
| 2126.2 | 0.051 |
| 2126.3 | 0.045 |
| 2126.4 | 0.043 |
| 2126.5 | 0.039 |
| 2126.6 | 0.045 |
| 2126.7 | 0.049 |
| 2126.8 | 0.037 |
| 2126.9 | 0.041 |
| 2127.0 | 0.04 |
| 2127.1 | 0.033 |
| 2127.2 | 0.023 |
| 2127.3 | 0.029 |
| 2127.4 | 0.024 |
| 2127.5 | 0.026 |
| 2127.6 | 0.028 |
| 2127.7 | 0.035 |
| 2127.8 | 0.029 |
| 2127.9 | 0.03 |
| 2128.0 | 0.028 |
| 2128.1 | 0.035 |
| 2128.2 | 0.025 |
| 2128.3 | 0.035 |
| 2128.4 | 0.031 |
| 2128.5 | 0.036 |
| 2128.6 | 0.028 |
| 2128.7 | 0.033 |
| 2128.8 | 0.03 |
| 2128.9 | 0.031 |
| 2129.0 | 0.033 |
| 2129.1 | 0.032 |
| 2129.2 | 0.03 |
| 2129.3 | 0.037 |
| 2129.4 | 0.041 |
| 2129.5 | 0.038 |
| 2129.6 | 0.036 |
| 2129.7 | 0.042 |
| 2129.8 | 0.044 |
| 2129.9 | 0.052 |
| 2130.0 | 0.051 |
| 2130.1 | 0.053 |
| 2130.2 | 0.049 |
| 2130.3 | 0.047 |
| 2130.4 | 0.047 |
| 2130.5 | 0.041 |
| 2130.6 | 0.047 |
| 2130.7 | 0.052 |
| 2130.8 | 0.051 |
| 2130.9 | 0.051 |
| 2131.0 | 0.053 |
| 2131.1 | 0.044 |
| 2131.2 | 0.047 |
| 2131.3 | 0.042 |
| 2131.4 | 0.035 |
| 2131.5 | 0.034 |
| 2131.6 | 0.034 |
| 2131.7 | 0.029 |
| 2131.8 | 0.033 |
| 2131.9 | 0.031 |
| 2132.0 | 0.034 |
| 2132.1 | 0.036 |
| 2132.2 | 0.036 |
| 2132.3 | 0.034 |
| 2132.4 | 0.042 |
| 2132.5 | 0.04 |
| 2132.6 | 0.045 |
| 2132.7 | 0.05 |
| 2132.8 | 0.057 |
| 2132.9 | 0.044 |
| 2133.0 | 0.042 |
| 2133.1 | 0.036 |
| 2133.2 | 0.031 |
| 2133.3 | 0.02 |
| 2133.4 | 0.025 |
| 2133.5 | 0.019 |
| 2133.6 | 0.029 |
| 2133.7 | 0.027 |
| 2133.8 | 0.032 |
| 2133.9 | 0.04 |
| 2134.0 | 0.04 |
| 2134.1 | 0.024 |
| 2134.2 | 0.026 |
| 2134.3 | 0.027 |
| 2134.4 | 0.016 |
| 2134.5 | 0.03 |
| 2134.6 | 0.042 |
| 2134.7 | 0.043 |
| 2134.8 | 0.041 |
| 2134.9 | 0.039 |
| 2135.0 | 0.03 |
| 2135.1 | 0.028 |
| 2135.2 | 0.019 |
| 2135.3 | 0.011 |
| 2135.4 | 0.017 |
| 2135.5 | 0.023 |
| 2135.6 | 0.027 |
| 2135.7 | 0.028 |
| 2135.8 | 0.031 |
| 2135.9 | 0.031 |
| 2136.0 | 0.028 |
| 2136.1 | 0.025 |
| 2136.2 | 0.024 |
| 2136.3 | 0.028 |
| 2136.4 | 0.03 |
| 2136.5 | 0.024 |
| 2136.6 | 0.029 |
| 2136.7 | 0.039 |
| 2136.8 | 0.041 |
| 2136.9 | 0.034 |
| 2137.0 | 0.034 |
| 2137.1 | 0.019 |
| 2137.2 | 0.022 |
| 2137.3 | 0.013 |
| 2137.4 | 0.017 |
| 2137.5 | 0.027 |
| 2137.6 | 0.049 |
| 2137.7 | 0.047 |
| 2137.8 | 0.053 |
| 2137.9 | 0.063 |
| 2138.0 | 0.058 |
| 2138.1 | 0.039 |
| 2138.2 | 0.03 |
| 2138.3 | 0.034 |
| 2138.4 | 0.02 |
| 2138.5 | 0.021 |
| 2138.6 | 0.031 |
| 2138.7 | 0.036 |
| 2138.8 | 0.022 |
| 2138.9 | 0.02 |
| 2139.0 | 0.019 |
| 2139.1 | 0.012 |
| 2139.2 | 0.014 |
| 2139.3 | 0.024 |
| 2139.4 | 0.03 |
| 2139.5 | 0.032 |
| 2139.6 | 0.034 |
| 2139.7 | 0.034 |
| 2139.8 | 0.026 |
| 2139.9 | 0.012 |
| 2140.0 | 0.015 |
| 2140.1 | 0.016 |
| 2140.2 | 0.01 |
| 2140.3 | 0.018 |
| 2140.4 | 0.042 |
| 2140.5 | 0.035 |
| 2140.6 | 0.032 |
| 2140.7 | 0.035 |
| 2140.8 | 0.025 |
| 2140.9 | 0.014 |
| 2141.0 | 0.012 |
| 2141.1 | 0.021 |
| 2141.2 | 0.018 |
| 2141.3 | 0.027 |
| 2141.4 | 0.032 |
| 2141.5 | 0.032 |
| 2141.6 | 0.029 |
| 2141.7 | 0.03 |
| 2141.8 | 0.029 |
| 2141.9 | 0.024 |
| 2142.0 | 0.028 |
| 2142.1 | 0.028 |
| 2142.2 | 0.02 |
| 2142.3 | 0.013 |
| 2142.4 | 0.014 |
| 2142.5 | 0.013 |
| 2142.6 | 0.005 |
| 2142.7 | 0.004 |
| 2142.8 | 0.015 |
| 2142.9 | 0.014 |
| 2143.0 | 0.021 |
| 2143.1 | 0.028 |
| 2143.2 | 0.038 |
| 2143.3 | 0.035 |
| 2143.4 | 0.037 |
| 2143.5 | 0.032 |
| 2143.6 | 0.035 |
| 2143.7 | 0.042 |
| 2143.8 | 0.038 |
| 2143.9 | 0.041 |
| 2144.0 | 0.032 |
| 2144.1 | 0.016 |
| 2144.2 | 0.009 |
| 2144.3 | 0.016 |
| 2144.4 | 0.013 |
| 2144.5 | 0.014 |
| 2144.6 | 0.026 |
| 2144.7 | 0.025 |
| 2144.8 | 0.029 |
| 2144.9 | 0.028 |
| 2145.0 | 0.039 |
| 2145.1 | 0.039 |
| 2145.2 | 0.038 |
| 2145.3 | 0.029 |
| 2145.4 | 0.034 |
| 2145.5 | 0.028 |
| 2145.6 | 0.032 |
| 2145.7 | 0.032 |
| 2145.8 | 0.031 |
| 2145.9 | 0.032 |
| 2146.0 | 0.04 |
| 2146.1 | 0.034 |
| 2146.2 | 0.027 |
| 2146.3 | 0.03 |
| 2146.4 | 0.031 |
| 2146.5 | 0.025 |
| 2146.6 | 0.029 |
| 2146.7 | 0.039 |
| 2146.8 | 0.038 |
| 2146.9 | 0.042 |
| 2147.0 | 0.044 |
| 2147.1 | 0.043 |
| 2147.2 | 0.044 |
| 2147.3 | 0.039 |
| 2147.4 | 0.026 |
| 2147.5 | 0.019 |
| 2147.6 | 0.014 |
| 2147.7 | 0.015 |
| 2147.8 | 0.016 |
| 2147.9 | 0.016 |
| 2148.0 | 0.023 |
| 2148.1 | 0.022 |
| 2148.2 | 0.019 |
| 2148.3 | 0.024 |
| 2148.4 | 0.021 |
| 2148.5 | 0.019 |
| 2148.6 | 0.02 |
| 2148.7 | 0.009 |
| 2148.8 | 0.009 |
| 2148.9 | 0.011 |
| 2149.0 | 0.003 |
| 2149.1 | 0.013 |
| 2149.2 | 0.02 |
| 2149.3 | 0.024 |
| 2149.4 | 0.027 |
| 2149.5 | 0.028 |
| 2149.6 | 0.016 |
| 2149.7 | 0.02 |
| 2149.8 | 0.017 |
| 2149.9 | 0.009 |
| 2150.0 | 0.01 |
| 2150.1 | 0.012 |
| 2150.2 | 0.017 |
| 2150.3 | 0.017 |
| 2150.4 | 0.02 |
| 2150.5 | 0.024 |
| 2150.6 | 0.016 |
| 2150.7 | 0.01 |
| 2150.8 | 0.005 |
| 2150.9 | 0.007 |
| 2151.0 | 0.014 |
| 2151.1 | 0.019 |
| 2151.2 | 0.022 |
| 2151.3 | 0.025 |
| 2151.4 | 0.03 |
| 2151.5 | 0.012 |
| 2151.6 | 0.014 |
| 2151.7 | 0.012 |
| 2151.8 | 0.011 |
| 2151.9 | 0.002 |
| 2152.0 | 0.01 |
| 2152.1 | 0.014 |
| 2152.2 | 0.015 |
| 2152.3 | 0.02 |
| 2152.4 | 0.031 |
| 2152.5 | 0.04 |
| 2152.6 | 0.039 |
| 2152.7 | 0.044 |
| 2152.8 | 0.037 |
| 2152.9 | 0.035 |
| 2153.0 | 0.031 |
| 2153.1 | 0.031 |
| 2153.2 | 0.018 |
| 2153.3 | 0.016 |
| 2153.4 | 0.009 |
| 2153.5 | 0.01 |
| 2153.6 | 0.006 |
| 2153.7 | 0.014 |
| 2153.8 | 0.02 |
| 2153.9 | 0.021 |
| 2154.0 | 0.022 |
| 2154.1 | 0.025 |
| 2154.2 | 0.025 |
| 2154.3 | 0.026 |
| 2154.4 | 0.033 |
| 2154.5 | 0.03 |
| 2154.6 | 0.028 |
| 2154.7 | 0.02 |
| 2154.8 | 0.027 |
| 2154.9 | 0.018 |
| 2155.0 | 0.026 |
| 2155.1 | 0.024 |
| 2155.2 | 0.032 |
| 2155.3 | 0.019 |
| 2155.4 | 0.024 |
| 2155.5 | 0.03 |
| 2155.6 | 0.037 |
| 2155.7 | 0.038 |
| 2155.8 | 0.042 |
| 2155.9 | 0.037 |
| 2156.0 | 0.022 |
| 2156.1 | 0.022 |
| 2156.2 | 0.015 |
| 2156.3 | 0.014 |
| 2156.4 | 0.026 |
| 2156.5 | 0.024 |
| 2156.6 | 0.028 |
| 2156.7 | 0.042 |
| 2156.8 | 0.037 |
| 2156.9 | 0.03 |
| 2157.0 | 0.03 |
| 2157.1 | 0.027 |
| 2157.2 | 0.013 |
| 2157.3 | 0.023 |
| 2157.4 | 0.019 |
| 2157.5 | 0.02 |
| 2157.6 | 0.017 |
| 2157.7 | 0.018 |
| 2157.8 | 0.022 |
| 2157.9 | 0.024 |
| 2158.0 | 0.031 |
| 2158.1 | 0.028 |
| 2158.2 | 0.028 |
| 2158.3 | 0.015 |
| 2158.4 | 0.023 |
| 2158.5 | 0.013 |
| 2158.6 | 0.014 |
| 2158.7 | 0.015 |
| 2158.8 | 0.028 |
| 2158.9 | 0.025 |
| 2159.0 | 0.033 |
| 2159.1 | 0.044 |
| 2159.2 | 0.048 |
| 2159.3 | 0.042 |
| 2159.4 | 0.032 |
| 2159.5 | 0.03 |
| 2159.6 | 0.012 |
| 2159.7 | 0.012 |
| 2159.8 | 0.02 |
| 2159.9 | 0.03 |
| 2160.0 | 0.031 |
| 2160.1 | 0.045 |
| 2160.2 | 0.048 |
| 2160.3 | 0.043 |
| 2160.4 | 0.029 |
| 2160.5 | 0.025 |
| 2160.6 | 0.011 |
| 2160.7 | 0.004 |
| 2160.8 | 0.005 |
| 2160.9 | 0.018 |
| 2161.0 | 0.023 |
| 2161.1 | 0.036 |
| 2161.2 | 0.034 |
| 2161.3 | 0.027 |
| 2161.4 | 0.026 |
| 2161.5 | 0.032 |
| 2161.6 | 0.033 |
| 2161.7 | 0.041 |
| 2161.8 | 0.045 |
| 2161.9 | 0.045 |
| 2162.0 | 0.033 |
| 2162.1 | 0.03 |
| 2162.2 | 0.03 |
| 2162.3 | 0.028 |
| 2162.4 | 0.035 |
| 2162.5 | 0.043 |
| 2162.6 | 0.045 |
| 2162.7 | 0.045 |
| 2162.8 | 0.044 |
| 2162.9 | 0.035 |
| 2163.0 | 0.032 |
| 2163.1 | 0.031 |
| 2163.2 | 0.032 |
| 2163.3 | 0.03 |
| 2163.4 | 0.038 |
| 2163.5 | 0.04 |
| 2163.6 | 0.038 |
| 2163.7 | 0.024 |
| 2163.8 | 0.034 |
| 2163.9 | 0.019 |
| 2164.0 | 0.01 |
| 2164.1 | 0.013 |
| 2164.2 | 0.029 |
| 2164.3 | 0.02 |
| 2164.4 | 0.031 |
| 2164.5 | 0.047 |
| 2164.6 | 0.028 |
| 2164.7 | 0.024 |
| 2164.8 | 0.017 |
| 2164.9 | 0.007 |
| 2165.0 | 0.008 |
| 2165.1 | 0.018 |
| 2165.2 | 0.015 |
| 2165.3 | 0.031 |
| 2165.4 | 0.03 |
| 2165.5 | 0.021 |
| 2165.6 | 0.029 |
| 2165.7 | 0.035 |
| 2165.8 | 0.03 |
| 2165.9 | 0.026 |
| 2166.0 | 0.021 |
| 2166.1 | 0.015 |
| 2166.2 | 0.009 |
| 2166.3 | 0.006 |
| 2166.4 | 0.015 |
| 2166.5 | 0.024 |
| 2166.6 | 0.029 |
| 2166.7 | 0.025 |
| 2166.8 | 0.026 |
| 2166.9 | 0.024 |
| 2167.0 | 0.025 |
| 2167.1 | 0.018 |
| 2167.2 | 0.032 |
| 2167.3 | 0.023 |
| 2167.4 | 0.025 |
| 2167.5 | 0.018 |
| 2167.6 | 0.018 |
| 2167.7 | 0.008 |
| 2167.8 | 0.018 |
| 2167.9 | 0.018 |
| 2168.0 | 0.024 |
| 2168.1 | 0.017 |
| 2168.2 | 0.02 |
| 2168.3 | 0.023 |
| 2168.4 | 0.02 |
| 2168.5 | 0.022 |
| 2168.6 | 0.024 |
| 2168.7 | 0.024 |
| 2168.8 | 0.024 |
| 2168.9 | 0.022 |
| 2169.0 | 0.012 |
| 2169.1 | 0.02 |
| 2169.2 | 0.013 |
| 2169.3 | 0.012 |
| 2169.4 | 0.022 |
| 2169.5 | 0.031 |
| 2169.6 | 0.032 |
| 2169.7 | 0.043 |
| 2169.8 | 0.039 |
| 2169.9 | 0.037 |
| 2170.0 | 0.036 |
| 2170.1 | 0.035 |
| 2170.2 | 0.032 |
| 2170.3 | 0.033 |
| 2170.4 | 0.036 |
| 2170.5 | 0.033 |
| 2170.6 | 0.029 |
| 2170.7 | 0.024 |
| 2170.8 | 0.025 |
| 2170.9 | 0.021 |
| 2171.0 | 0.022 |
| 2171.1 | 0.029 |
| 2171.2 | 0.035 |
| 2171.3 | 0.032 |
| 2171.4 | 0.026 |
| 2171.5 | 0.035 |
| 2171.6 | 0.03 |
| 2171.7 | 0.021 |
| 2171.8 | 0.024 |
| 2171.9 | 0.033 |
| 2172.0 | 0.021 |
| 2172.1 | 0.02 |
| 2172.2 | 0.028 |
| 2172.3 | 0.02 |
| 2172.4 | 0.024 |
| 2172.5 | 0.018 |
| 2172.6 | 0.02 |
| 2172.7 | 0.012 |
| 2172.8 | 0.029 |
| 2172.9 | 0.02 |
| 2173.0 | 0.022 |
| 2173.1 | 0.024 |
| 2173.2 | 0.03 |
| 2173.3 | 0.017 |
| 2173.4 | 0.019 |
| 2173.5 | 0.036 |
| 2173.6 | 0.04 |
| 2173.7 | 0.035 |
| 2173.8 | 0.043 |
| 2173.9 | 0.037 |
| 2174.0 | 0.03 |
| 2174.1 | 0.023 |
| 2174.2 | 0.026 |
| 2174.3 | 0.027 |
| 2174.4 | 0.024 |
| 2174.5 | 0.018 |
| 2174.6 | 0.032 |
| 2174.7 | 0.022 |
| 2174.8 | 0.023 |
| 2174.9 | 0.028 |
| 2175.0 | 0.033 |
| 2175.1 | 0.025 |
| 2175.2 | 0.035 |
| 2175.3 | 0.027 |
| 2175.4 | 0.034 |
| 2175.5 | 0.032 |
| 2175.6 | 0.022 |
| 2175.7 | 0.018 |
| 2175.8 | 0.024 |
| 2175.9 | 0.019 |
| 2176.0 | 0.025 |
| 2176.1 | 0.029 |
| 2176.2 | 0.03 |
| 2176.3 | 0.032 |
| 2176.4 | 0.03 |
| 2176.5 | 0.016 |
| 2176.6 | 0.02 |
| 2176.7 | 0.023 |
| 2176.8 | 0.002 |
| 2176.9 | 0.01 |
| 2177.0 | 0.019 |
| 2177.1 | 0.017 |
| 2177.2 | 0.014 |
| 2177.3 | 0.031 |
| 2177.4 | 0.024 |
| 2177.5 | 0.022 |
| 2177.6 | 0.026 |
| 2177.7 | 0.033 |
| 2177.8 | 0.031 |
| 2177.9 | 0.032 |
| 2178.0 | 0.035 |
| 2178.1 | 0.033 |
| 2178.2 | 0.034 |
| 2178.3 | 0.038 |
| 2178.4 | 0.033 |
| 2178.5 | 0.038 |
| 2178.6 | 0.045 |
| 2178.7 | 0.037 |
| 2178.8 | 0.034 |
| 2178.9 | 0.042 |
| 2179.0 | 0.04 |
| 2179.1 | 0.035 |
| 2179.2 | 0.036 |
| 2179.3 | 0.03 |
| 2179.4 | 0.025 |
| 2179.5 | 0.019 |
| 2179.6 | 0.018 |
| 2179.7 | 0.024 |
| 2179.8 | 0.037 |
| 2179.9 | 0.047 |
| 2180.0 | 0.04 |
| 2180.1 | 0.041 |
| 2180.2 | 0.036 |
| 2180.3 | 0.023 |
| 2180.4 | 0.019 |
| 2180.5 | 0.021 |
| 2180.6 | 0.027 |
| 2180.7 | 0.035 |
| 2180.8 | 0.046 |
| 2180.9 | 0.041 |
| 2181.0 | 0.056 |
| 2181.1 | 0.05 |
| 2181.2 | 0.042 |
| 2181.3 | 0.036 |
| 2181.4 | 0.036 |
| 2181.5 | 0.024 |
| 2181.6 | 0.021 |
| 2181.7 | 0.027 |
| 2181.8 | 0.022 |
| 2181.9 | 0.024 |
| 2182.0 | 0.036 |
| 2182.1 | 0.03 |
| 2182.2 | 0.023 |
| 2182.3 | 0.023 |
| 2182.4 | 0.022 |
| 2182.5 | 0.013 |
| 2182.6 | 0.021 |
| 2182.7 | 0.018 |
| 2182.8 | 0.029 |
| 2182.9 | 0.024 |
| 2183.0 | 0.022 |
| 2183.1 | 0.019 |
| 2183.2 | 0.026 |
| 2183.3 | 0.025 |
| 2183.4 | 0.028 |
| 2183.5 | 0.031 |
| 2183.6 | 0.035 |
| 2183.7 | 0.034 |
| 2183.8 | 0.035 |
| 2183.9 | 0.036 |
| 2184.0 | 0.038 |
| 2184.1 | 0.027 |
| 2184.2 | 0.022 |
| 2184.3 | 0.021 |
| 2184.4 | 0.026 |
| 2184.5 | 0.016 |
| 2184.6 | 0.018 |
| 2184.7 | 0.013 |
| 2184.8 | 0.011 |
| 2184.9 | 0.011 |
| 2185.0 | 0.014 |
| 2185.1 | 0.022 |
| 2185.2 | 0.03 |
| 2185.3 | 0.024 |
| 2185.4 | 0.029 |
| 2185.5 | 0.035 |
| 2185.6 | 0.037 |
| 2185.7 | 0.039 |
| 2185.8 | 0.046 |
| 2185.9 | 0.034 |
| 2186.0 | 0.035 |
| 2186.1 | 0.018 |
| 2186.2 | 0.018 |
| 2186.3 | 0.013 |
| 2186.4 | 0.017 |
| 2186.5 | 0.014 |
| 2186.6 | 0.019 |
| 2186.7 | 0.009 |
| 2186.8 | 0.022 |
| 2186.9 | 0.012 |
| 2187.0 | 0.008 |
| 2187.1 | 0.018 |
| 2187.2 | 0.021 |
| 2187.3 | 0.012 |
| 2187.4 | 0.022 |
| 2187.5 | 0.023 |
| 2187.6 | 0.023 |
| 2187.7 | 0.032 |
| 2187.8 | 0.022 |
| 2187.9 | 0.013 |
| 2188.0 | 0.018 |
| 2188.1 | 0.015 |
| 2188.2 | 0.012 |
| 2188.3 | 0.019 |
| 2188.4 | 0.036 |
| 2188.5 | 0.034 |
| 2188.6 | 0.043 |
| 2188.7 | 0.036 |
| 2188.8 | 0.044 |
| 2188.9 | 0.041 |
| 2189.0 | 0.037 |
| 2189.1 | 0.027 |
| 2189.2 | 0.025 |
| 2189.3 | 0.025 |
| 2189.4 | 0.014 |
| 2189.5 | 0.015 |
| 2189.6 | 0.015 |
| 2189.7 | 0.019 |
| 2189.8 | 0.03 |
| 2189.9 | 0.03 |
| 2190.0 | 0.035 |
| 2190.1 | 0.048 |
| 2190.2 | 0.035 |
| 2190.3 | 0.016 |
| 2190.4 | 0.02 |
| 2190.5 | 0.014 |
| 2190.6 | 0.008 |
| 2190.7 | 0.018 |
| 2190.8 | 0.028 |
| 2190.9 | 0.025 |
| 2191.0 | 0.024 |
| 2191.1 | 0.017 |
| 2191.2 | 0.017 |
| 2191.3 | 0.014 |
| 2191.4 | 0.022 |
| 2191.5 | 0.033 |
| 2191.6 | 0.033 |
| 2191.7 | 0.038 |
| 2191.8 | 0.035 |
| 2191.9 | 0.023 |
| 2192.0 | 0.017 |
| 2192.1 | 0.026 |
| 2192.2 | 0.025 |
| 2192.3 | 0.03 |
| 2192.4 | 0.036 |
| 2192.5 | 0.044 |
| 2192.6 | 0.032 |
| 2192.7 | 0.032 |
| 2192.8 | 0.019 |
| 2192.9 | 0.013 |
| 2193.0 | 0.011 |
| 2193.1 | 0.011 |
| 2193.2 | 0.015 |
| 2193.3 | 0.034 |
| 2193.4 | 0.036 |
| 2193.5 | 0.029 |
| 2193.6 | 0.029 |
| 2193.7 | 0.017 |
| 2193.8 | 0.004 |
| 2193.9 | 0.012 |
| 2194.0 | 0.021 |
| 2194.1 | 0.029 |
| 2194.2 | 0.035 |
| 2194.3 | 0.028 |
| 2194.4 | 0.015 |
| 2194.5 | 0.003 |
| 2194.6 | 0.013 |
| 2194.7 | 0.014 |
| 2194.8 | 0.015 |
| 2194.9 | 0.019 |
| 2195.0 | 0.018 |
| 2195.1 | 0 |
| 2195.2 | 0.007 |
| 2195.3 | 0.014 |
| 2195.4 | 0.02 |
| 2195.5 | 0.019 |
| 2195.6 | 0.022 |
| 2195.7 | 0.018 |
| 2195.8 | 0.017 |
| 2195.9 | 0.013 |
| 2196.0 | 0.024 |
| 2196.1 | 0.025 |
| 2196.2 | 0.014 |
| 2196.3 | 0.018 |
| 2196.4 | 0.016 |
| 2196.5 | 0.023 |
| 2196.6 | 0.024 |
| 2196.7 | 0.031 |
| 2196.8 | 0.03 |
| 2196.9 | 0.029 |
| 2197.0 | 0.01 |
| 2197.1 | 0.007 |
| 2197.2 | 0.006 |
| 2197.3 | 0.008 |
| 2197.4 | 0.027 |
| 2197.5 | 0.041 |
| 2197.6 | 0.035 |
| 2197.7 | 0.028 |
| 2197.8 | 0.028 |
| 2197.9 | 0.003 |
| 2198.0 | 0 |
| 2198.1 | 0.02 |
| 2198.2 | 0.026 |
| 2198.3 | 0.021 |
| 2198.4 | 0.032 |
| 2198.5 | 0.036 |
| 2198.6 | 0.036 |
| 2198.7 | 0.035 |
| 2198.8 | 0.035 |
| 2198.9 | 0.029 |
| 2199.0 | 0.022 |
| 2199.1 | 0.017 |
| 2199.2 | 0.028 |
| 2199.3 | 0.037 |
| 2199.4 | 0.041 |
| 2199.5 | 0.044 |
| 2199.6 | 0.036 |
| 2199.7 | 0.031 |
| 2199.8 | 0.032 |
| 2199.9 | 0.039 |
| 2200.0 | 0.046 |